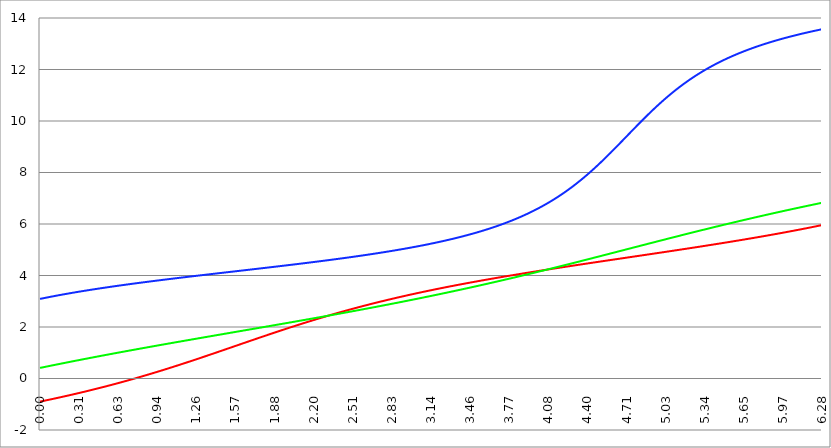
| Category | Series 1 | Series 0 | Series 2 |
|---|---|---|---|
| 0.0 | -0.898 | 0.411 | 3.091 |
| 0.00314159265358979 | -0.895 | 0.414 | 3.094 |
| 0.00628318530717958 | -0.892 | 0.417 | 3.097 |
| 0.00942477796076938 | -0.889 | 0.42 | 3.1 |
| 0.0125663706143592 | -0.885 | 0.424 | 3.103 |
| 0.015707963267949 | -0.882 | 0.427 | 3.107 |
| 0.0188495559215388 | -0.879 | 0.43 | 3.11 |
| 0.0219911485751285 | -0.876 | 0.433 | 3.113 |
| 0.0251327412287183 | -0.873 | 0.436 | 3.116 |
| 0.0282743338823081 | -0.87 | 0.439 | 3.119 |
| 0.0314159265358979 | -0.866 | 0.442 | 3.122 |
| 0.0345575191894877 | -0.863 | 0.445 | 3.125 |
| 0.0376991118430775 | -0.86 | 0.449 | 3.128 |
| 0.0408407044966673 | -0.857 | 0.452 | 3.131 |
| 0.0439822971502571 | -0.854 | 0.455 | 3.134 |
| 0.0471238898038469 | -0.85 | 0.458 | 3.137 |
| 0.0502654824574367 | -0.847 | 0.461 | 3.14 |
| 0.0534070751110265 | -0.844 | 0.464 | 3.143 |
| 0.0565486677646163 | -0.841 | 0.467 | 3.146 |
| 0.059690260418206 | -0.838 | 0.47 | 3.149 |
| 0.0628318530717958 | -0.834 | 0.473 | 3.152 |
| 0.0659734457253856 | -0.831 | 0.477 | 3.155 |
| 0.0691150383789754 | -0.828 | 0.48 | 3.158 |
| 0.0722566310325652 | -0.825 | 0.483 | 3.161 |
| 0.075398223686155 | -0.821 | 0.486 | 3.164 |
| 0.0785398163397448 | -0.818 | 0.489 | 3.167 |
| 0.0816814089933346 | -0.815 | 0.492 | 3.17 |
| 0.0848230016469244 | -0.812 | 0.495 | 3.173 |
| 0.0879645943005142 | -0.808 | 0.498 | 3.176 |
| 0.091106186954104 | -0.805 | 0.501 | 3.179 |
| 0.0942477796076937 | -0.802 | 0.504 | 3.182 |
| 0.0973893722612835 | -0.799 | 0.507 | 3.185 |
| 0.100530964914873 | -0.795 | 0.511 | 3.188 |
| 0.103672557568463 | -0.792 | 0.514 | 3.191 |
| 0.106814150222053 | -0.789 | 0.517 | 3.193 |
| 0.109955742875643 | -0.786 | 0.52 | 3.196 |
| 0.113097335529233 | -0.782 | 0.523 | 3.199 |
| 0.116238928182822 | -0.779 | 0.526 | 3.202 |
| 0.119380520836412 | -0.776 | 0.529 | 3.205 |
| 0.122522113490002 | -0.772 | 0.532 | 3.208 |
| 0.125663706143592 | -0.769 | 0.535 | 3.211 |
| 0.128805298797181 | -0.766 | 0.538 | 3.214 |
| 0.131946891450771 | -0.762 | 0.541 | 3.216 |
| 0.135088484104361 | -0.759 | 0.544 | 3.219 |
| 0.138230076757951 | -0.756 | 0.547 | 3.222 |
| 0.141371669411541 | -0.752 | 0.55 | 3.225 |
| 0.14451326206513 | -0.749 | 0.553 | 3.228 |
| 0.14765485471872 | -0.746 | 0.557 | 3.231 |
| 0.15079644737231 | -0.742 | 0.56 | 3.233 |
| 0.1539380400259 | -0.739 | 0.563 | 3.236 |
| 0.15707963267949 | -0.736 | 0.566 | 3.239 |
| 0.160221225333079 | -0.732 | 0.569 | 3.242 |
| 0.163362817986669 | -0.729 | 0.572 | 3.245 |
| 0.166504410640259 | -0.726 | 0.575 | 3.247 |
| 0.169646003293849 | -0.722 | 0.578 | 3.25 |
| 0.172787595947439 | -0.719 | 0.581 | 3.253 |
| 0.175929188601028 | -0.716 | 0.584 | 3.256 |
| 0.179070781254618 | -0.712 | 0.587 | 3.258 |
| 0.182212373908208 | -0.709 | 0.59 | 3.261 |
| 0.185353966561798 | -0.705 | 0.593 | 3.264 |
| 0.188495559215388 | -0.702 | 0.596 | 3.267 |
| 0.191637151868977 | -0.699 | 0.599 | 3.269 |
| 0.194778744522567 | -0.695 | 0.602 | 3.272 |
| 0.197920337176157 | -0.692 | 0.605 | 3.275 |
| 0.201061929829747 | -0.688 | 0.608 | 3.277 |
| 0.204203522483336 | -0.685 | 0.611 | 3.28 |
| 0.207345115136926 | -0.682 | 0.614 | 3.283 |
| 0.210486707790516 | -0.678 | 0.617 | 3.286 |
| 0.213628300444106 | -0.675 | 0.62 | 3.288 |
| 0.216769893097696 | -0.671 | 0.623 | 3.291 |
| 0.219911485751285 | -0.668 | 0.626 | 3.294 |
| 0.223053078404875 | -0.664 | 0.629 | 3.296 |
| 0.226194671058465 | -0.661 | 0.632 | 3.299 |
| 0.229336263712055 | -0.658 | 0.635 | 3.302 |
| 0.232477856365645 | -0.654 | 0.638 | 3.304 |
| 0.235619449019234 | -0.651 | 0.641 | 3.307 |
| 0.238761041672824 | -0.647 | 0.644 | 3.31 |
| 0.241902634326414 | -0.644 | 0.647 | 3.312 |
| 0.245044226980004 | -0.64 | 0.65 | 3.315 |
| 0.248185819633594 | -0.637 | 0.653 | 3.317 |
| 0.251327412287183 | -0.633 | 0.656 | 3.32 |
| 0.254469004940773 | -0.63 | 0.659 | 3.323 |
| 0.257610597594363 | -0.626 | 0.662 | 3.325 |
| 0.260752190247953 | -0.623 | 0.665 | 3.328 |
| 0.263893782901543 | -0.619 | 0.668 | 3.331 |
| 0.267035375555132 | -0.616 | 0.671 | 3.333 |
| 0.270176968208722 | -0.612 | 0.674 | 3.336 |
| 0.273318560862312 | -0.609 | 0.677 | 3.338 |
| 0.276460153515902 | -0.605 | 0.68 | 3.341 |
| 0.279601746169492 | -0.602 | 0.683 | 3.343 |
| 0.282743338823082 | -0.598 | 0.686 | 3.346 |
| 0.285884931476671 | -0.595 | 0.689 | 3.349 |
| 0.289026524130261 | -0.591 | 0.692 | 3.351 |
| 0.292168116783851 | -0.587 | 0.695 | 3.354 |
| 0.295309709437441 | -0.584 | 0.698 | 3.356 |
| 0.298451302091031 | -0.58 | 0.701 | 3.359 |
| 0.30159289474462 | -0.577 | 0.704 | 3.361 |
| 0.30473448739821 | -0.573 | 0.707 | 3.364 |
| 0.3078760800518 | -0.57 | 0.71 | 3.366 |
| 0.31101767270539 | -0.566 | 0.713 | 3.369 |
| 0.31415926535898 | -0.562 | 0.716 | 3.371 |
| 0.31730085801257 | -0.559 | 0.719 | 3.374 |
| 0.320442450666159 | -0.555 | 0.722 | 3.376 |
| 0.323584043319749 | -0.552 | 0.725 | 3.379 |
| 0.326725635973339 | -0.548 | 0.728 | 3.382 |
| 0.329867228626929 | -0.544 | 0.731 | 3.384 |
| 0.333008821280519 | -0.541 | 0.734 | 3.386 |
| 0.336150413934108 | -0.537 | 0.736 | 3.389 |
| 0.339292006587698 | -0.534 | 0.739 | 3.391 |
| 0.342433599241288 | -0.53 | 0.742 | 3.394 |
| 0.345575191894878 | -0.526 | 0.745 | 3.396 |
| 0.348716784548468 | -0.523 | 0.748 | 3.399 |
| 0.351858377202058 | -0.519 | 0.751 | 3.401 |
| 0.354999969855647 | -0.515 | 0.754 | 3.404 |
| 0.358141562509237 | -0.512 | 0.757 | 3.406 |
| 0.361283155162827 | -0.508 | 0.76 | 3.409 |
| 0.364424747816417 | -0.504 | 0.763 | 3.411 |
| 0.367566340470007 | -0.501 | 0.766 | 3.414 |
| 0.370707933123597 | -0.497 | 0.769 | 3.416 |
| 0.373849525777186 | -0.493 | 0.772 | 3.418 |
| 0.376991118430776 | -0.49 | 0.775 | 3.421 |
| 0.380132711084366 | -0.486 | 0.778 | 3.423 |
| 0.383274303737956 | -0.482 | 0.78 | 3.426 |
| 0.386415896391546 | -0.479 | 0.783 | 3.428 |
| 0.389557489045135 | -0.475 | 0.786 | 3.431 |
| 0.392699081698725 | -0.471 | 0.789 | 3.433 |
| 0.395840674352315 | -0.468 | 0.792 | 3.435 |
| 0.398982267005905 | -0.464 | 0.795 | 3.438 |
| 0.402123859659495 | -0.46 | 0.798 | 3.44 |
| 0.405265452313085 | -0.456 | 0.801 | 3.443 |
| 0.408407044966674 | -0.453 | 0.804 | 3.445 |
| 0.411548637620264 | -0.449 | 0.807 | 3.447 |
| 0.414690230273854 | -0.445 | 0.81 | 3.45 |
| 0.417831822927444 | -0.441 | 0.813 | 3.452 |
| 0.420973415581034 | -0.438 | 0.815 | 3.454 |
| 0.424115008234623 | -0.434 | 0.818 | 3.457 |
| 0.427256600888213 | -0.43 | 0.821 | 3.459 |
| 0.430398193541803 | -0.426 | 0.824 | 3.462 |
| 0.433539786195393 | -0.423 | 0.827 | 3.464 |
| 0.436681378848983 | -0.419 | 0.83 | 3.466 |
| 0.439822971502573 | -0.415 | 0.833 | 3.469 |
| 0.442964564156162 | -0.411 | 0.836 | 3.471 |
| 0.446106156809752 | -0.408 | 0.839 | 3.473 |
| 0.449247749463342 | -0.404 | 0.842 | 3.476 |
| 0.452389342116932 | -0.4 | 0.844 | 3.478 |
| 0.455530934770522 | -0.396 | 0.847 | 3.48 |
| 0.458672527424111 | -0.392 | 0.85 | 3.483 |
| 0.461814120077701 | -0.388 | 0.853 | 3.485 |
| 0.464955712731291 | -0.385 | 0.856 | 3.487 |
| 0.468097305384881 | -0.381 | 0.859 | 3.49 |
| 0.471238898038471 | -0.377 | 0.862 | 3.492 |
| 0.474380490692061 | -0.373 | 0.865 | 3.494 |
| 0.47752208334565 | -0.369 | 0.867 | 3.496 |
| 0.48066367599924 | -0.365 | 0.87 | 3.499 |
| 0.48380526865283 | -0.362 | 0.873 | 3.501 |
| 0.48694686130642 | -0.358 | 0.876 | 3.503 |
| 0.49008845396001 | -0.354 | 0.879 | 3.506 |
| 0.493230046613599 | -0.35 | 0.882 | 3.508 |
| 0.496371639267189 | -0.346 | 0.885 | 3.51 |
| 0.499513231920779 | -0.342 | 0.888 | 3.512 |
| 0.502654824574369 | -0.338 | 0.89 | 3.515 |
| 0.505796417227959 | -0.334 | 0.893 | 3.517 |
| 0.508938009881549 | -0.331 | 0.896 | 3.519 |
| 0.512079602535138 | -0.327 | 0.899 | 3.521 |
| 0.515221195188728 | -0.323 | 0.902 | 3.524 |
| 0.518362787842318 | -0.319 | 0.905 | 3.526 |
| 0.521504380495908 | -0.315 | 0.908 | 3.528 |
| 0.524645973149498 | -0.311 | 0.91 | 3.53 |
| 0.527787565803087 | -0.307 | 0.913 | 3.533 |
| 0.530929158456677 | -0.303 | 0.916 | 3.535 |
| 0.534070751110267 | -0.299 | 0.919 | 3.537 |
| 0.537212343763857 | -0.295 | 0.922 | 3.539 |
| 0.540353936417447 | -0.291 | 0.925 | 3.542 |
| 0.543495529071037 | -0.287 | 0.928 | 3.544 |
| 0.546637121724626 | -0.283 | 0.93 | 3.546 |
| 0.549778714378216 | -0.279 | 0.933 | 3.548 |
| 0.552920307031806 | -0.275 | 0.936 | 3.551 |
| 0.556061899685396 | -0.271 | 0.939 | 3.553 |
| 0.559203492338986 | -0.267 | 0.942 | 3.555 |
| 0.562345084992576 | -0.263 | 0.945 | 3.557 |
| 0.565486677646165 | -0.259 | 0.947 | 3.559 |
| 0.568628270299755 | -0.255 | 0.95 | 3.562 |
| 0.571769862953345 | -0.251 | 0.953 | 3.564 |
| 0.574911455606935 | -0.247 | 0.956 | 3.566 |
| 0.578053048260525 | -0.243 | 0.959 | 3.568 |
| 0.581194640914114 | -0.239 | 0.962 | 3.57 |
| 0.584336233567704 | -0.235 | 0.964 | 3.572 |
| 0.587477826221294 | -0.231 | 0.967 | 3.575 |
| 0.590619418874884 | -0.227 | 0.97 | 3.577 |
| 0.593761011528474 | -0.223 | 0.973 | 3.579 |
| 0.596902604182064 | -0.219 | 0.976 | 3.581 |
| 0.600044196835653 | -0.215 | 0.979 | 3.583 |
| 0.603185789489243 | -0.211 | 0.981 | 3.586 |
| 0.606327382142833 | -0.207 | 0.984 | 3.588 |
| 0.609468974796423 | -0.203 | 0.987 | 3.59 |
| 0.612610567450013 | -0.199 | 0.99 | 3.592 |
| 0.615752160103602 | -0.195 | 0.993 | 3.594 |
| 0.618893752757192 | -0.191 | 0.996 | 3.596 |
| 0.622035345410782 | -0.187 | 0.998 | 3.598 |
| 0.625176938064372 | -0.182 | 1.001 | 3.601 |
| 0.628318530717962 | -0.178 | 1.004 | 3.603 |
| 0.631460123371551 | -0.174 | 1.007 | 3.605 |
| 0.634601716025141 | -0.17 | 1.01 | 3.607 |
| 0.637743308678731 | -0.166 | 1.012 | 3.609 |
| 0.640884901332321 | -0.162 | 1.015 | 3.611 |
| 0.644026493985911 | -0.158 | 1.018 | 3.613 |
| 0.647168086639501 | -0.154 | 1.021 | 3.615 |
| 0.65030967929309 | -0.149 | 1.024 | 3.618 |
| 0.65345127194668 | -0.145 | 1.026 | 3.62 |
| 0.65659286460027 | -0.141 | 1.029 | 3.622 |
| 0.65973445725386 | -0.137 | 1.032 | 3.624 |
| 0.66287604990745 | -0.133 | 1.035 | 3.626 |
| 0.666017642561039 | -0.129 | 1.038 | 3.628 |
| 0.669159235214629 | -0.125 | 1.04 | 3.63 |
| 0.672300827868219 | -0.12 | 1.043 | 3.632 |
| 0.675442420521809 | -0.116 | 1.046 | 3.634 |
| 0.678584013175399 | -0.112 | 1.049 | 3.637 |
| 0.681725605828989 | -0.108 | 1.052 | 3.639 |
| 0.684867198482578 | -0.104 | 1.054 | 3.641 |
| 0.688008791136168 | -0.099 | 1.057 | 3.643 |
| 0.691150383789758 | -0.095 | 1.06 | 3.645 |
| 0.694291976443348 | -0.091 | 1.063 | 3.647 |
| 0.697433569096938 | -0.087 | 1.065 | 3.649 |
| 0.700575161750528 | -0.082 | 1.068 | 3.651 |
| 0.703716754404117 | -0.078 | 1.071 | 3.653 |
| 0.706858347057707 | -0.074 | 1.074 | 3.655 |
| 0.709999939711297 | -0.07 | 1.077 | 3.657 |
| 0.713141532364887 | -0.065 | 1.079 | 3.659 |
| 0.716283125018477 | -0.061 | 1.082 | 3.661 |
| 0.719424717672066 | -0.057 | 1.085 | 3.663 |
| 0.722566310325656 | -0.053 | 1.088 | 3.666 |
| 0.725707902979246 | -0.048 | 1.09 | 3.668 |
| 0.728849495632836 | -0.044 | 1.093 | 3.67 |
| 0.731991088286426 | -0.04 | 1.096 | 3.672 |
| 0.735132680940016 | -0.036 | 1.099 | 3.674 |
| 0.738274273593605 | -0.031 | 1.102 | 3.676 |
| 0.741415866247195 | -0.027 | 1.104 | 3.678 |
| 0.744557458900785 | -0.023 | 1.107 | 3.68 |
| 0.747699051554375 | -0.018 | 1.11 | 3.682 |
| 0.750840644207965 | -0.014 | 1.113 | 3.684 |
| 0.753982236861554 | -0.01 | 1.115 | 3.686 |
| 0.757123829515144 | -0.005 | 1.118 | 3.688 |
| 0.760265422168734 | -0.001 | 1.121 | 3.69 |
| 0.763407014822324 | 0.003 | 1.124 | 3.692 |
| 0.766548607475914 | 0.008 | 1.126 | 3.694 |
| 0.769690200129504 | 0.012 | 1.129 | 3.696 |
| 0.772831792783093 | 0.016 | 1.132 | 3.698 |
| 0.775973385436683 | 0.021 | 1.135 | 3.7 |
| 0.779114978090273 | 0.025 | 1.137 | 3.702 |
| 0.782256570743863 | 0.029 | 1.14 | 3.704 |
| 0.785398163397453 | 0.034 | 1.143 | 3.706 |
| 0.788539756051042 | 0.038 | 1.146 | 3.708 |
| 0.791681348704632 | 0.043 | 1.148 | 3.71 |
| 0.794822941358222 | 0.047 | 1.151 | 3.712 |
| 0.797964534011812 | 0.051 | 1.154 | 3.714 |
| 0.801106126665402 | 0.056 | 1.157 | 3.716 |
| 0.804247719318992 | 0.06 | 1.159 | 3.718 |
| 0.807389311972581 | 0.065 | 1.162 | 3.72 |
| 0.810530904626171 | 0.069 | 1.165 | 3.722 |
| 0.813672497279761 | 0.073 | 1.168 | 3.724 |
| 0.816814089933351 | 0.078 | 1.17 | 3.726 |
| 0.819955682586941 | 0.082 | 1.173 | 3.728 |
| 0.823097275240531 | 0.087 | 1.176 | 3.73 |
| 0.82623886789412 | 0.091 | 1.179 | 3.732 |
| 0.82938046054771 | 0.096 | 1.181 | 3.734 |
| 0.8325220532013 | 0.1 | 1.184 | 3.736 |
| 0.83566364585489 | 0.105 | 1.187 | 3.738 |
| 0.83880523850848 | 0.109 | 1.19 | 3.74 |
| 0.841946831162069 | 0.114 | 1.192 | 3.742 |
| 0.845088423815659 | 0.118 | 1.195 | 3.744 |
| 0.848230016469249 | 0.123 | 1.198 | 3.746 |
| 0.851371609122839 | 0.127 | 1.201 | 3.748 |
| 0.854513201776429 | 0.132 | 1.203 | 3.75 |
| 0.857654794430019 | 0.136 | 1.206 | 3.752 |
| 0.860796387083608 | 0.141 | 1.209 | 3.754 |
| 0.863937979737198 | 0.145 | 1.211 | 3.756 |
| 0.867079572390788 | 0.15 | 1.214 | 3.758 |
| 0.870221165044378 | 0.154 | 1.217 | 3.76 |
| 0.873362757697968 | 0.159 | 1.22 | 3.761 |
| 0.876504350351557 | 0.163 | 1.222 | 3.763 |
| 0.879645943005147 | 0.168 | 1.225 | 3.765 |
| 0.882787535658737 | 0.172 | 1.228 | 3.767 |
| 0.885929128312327 | 0.177 | 1.231 | 3.769 |
| 0.889070720965917 | 0.181 | 1.233 | 3.771 |
| 0.892212313619507 | 0.186 | 1.236 | 3.773 |
| 0.895353906273096 | 0.19 | 1.239 | 3.775 |
| 0.898495498926686 | 0.195 | 1.241 | 3.777 |
| 0.901637091580276 | 0.2 | 1.244 | 3.779 |
| 0.904778684233866 | 0.204 | 1.247 | 3.781 |
| 0.907920276887456 | 0.209 | 1.25 | 3.783 |
| 0.911061869541045 | 0.213 | 1.252 | 3.785 |
| 0.914203462194635 | 0.218 | 1.255 | 3.787 |
| 0.917345054848225 | 0.223 | 1.258 | 3.789 |
| 0.920486647501815 | 0.227 | 1.26 | 3.79 |
| 0.923628240155405 | 0.232 | 1.263 | 3.792 |
| 0.926769832808995 | 0.236 | 1.266 | 3.794 |
| 0.929911425462584 | 0.241 | 1.269 | 3.796 |
| 0.933053018116174 | 0.246 | 1.271 | 3.798 |
| 0.936194610769764 | 0.25 | 1.274 | 3.8 |
| 0.939336203423354 | 0.255 | 1.277 | 3.802 |
| 0.942477796076944 | 0.26 | 1.279 | 3.804 |
| 0.945619388730533 | 0.264 | 1.282 | 3.806 |
| 0.948760981384123 | 0.269 | 1.285 | 3.808 |
| 0.951902574037713 | 0.274 | 1.287 | 3.81 |
| 0.955044166691303 | 0.278 | 1.29 | 3.811 |
| 0.958185759344893 | 0.283 | 1.293 | 3.813 |
| 0.961327351998483 | 0.288 | 1.296 | 3.815 |
| 0.964468944652072 | 0.292 | 1.298 | 3.817 |
| 0.967610537305662 | 0.297 | 1.301 | 3.819 |
| 0.970752129959252 | 0.302 | 1.304 | 3.821 |
| 0.973893722612842 | 0.306 | 1.306 | 3.823 |
| 0.977035315266432 | 0.311 | 1.309 | 3.825 |
| 0.980176907920022 | 0.316 | 1.312 | 3.827 |
| 0.983318500573611 | 0.32 | 1.314 | 3.829 |
| 0.986460093227201 | 0.325 | 1.317 | 3.83 |
| 0.989601685880791 | 0.33 | 1.32 | 3.832 |
| 0.992743278534381 | 0.334 | 1.323 | 3.834 |
| 0.995884871187971 | 0.339 | 1.325 | 3.836 |
| 0.99902646384156 | 0.344 | 1.328 | 3.838 |
| 1.00216805649515 | 0.349 | 1.331 | 3.84 |
| 1.00530964914874 | 0.353 | 1.333 | 3.842 |
| 1.00845124180233 | 0.358 | 1.336 | 3.844 |
| 1.01159283445592 | 0.363 | 1.339 | 3.845 |
| 1.01473442710951 | 0.368 | 1.341 | 3.847 |
| 1.017876019763099 | 0.372 | 1.344 | 3.849 |
| 1.021017612416689 | 0.377 | 1.347 | 3.851 |
| 1.02415920507028 | 0.382 | 1.349 | 3.853 |
| 1.027300797723869 | 0.387 | 1.352 | 3.855 |
| 1.030442390377459 | 0.392 | 1.355 | 3.857 |
| 1.033583983031048 | 0.396 | 1.357 | 3.858 |
| 1.036725575684638 | 0.401 | 1.36 | 3.86 |
| 1.039867168338228 | 0.406 | 1.363 | 3.862 |
| 1.043008760991818 | 0.411 | 1.365 | 3.864 |
| 1.046150353645408 | 0.416 | 1.368 | 3.866 |
| 1.049291946298998 | 0.42 | 1.371 | 3.868 |
| 1.052433538952587 | 0.425 | 1.374 | 3.87 |
| 1.055575131606177 | 0.43 | 1.376 | 3.871 |
| 1.058716724259767 | 0.435 | 1.379 | 3.873 |
| 1.061858316913357 | 0.44 | 1.382 | 3.875 |
| 1.064999909566947 | 0.444 | 1.384 | 3.877 |
| 1.068141502220536 | 0.449 | 1.387 | 3.879 |
| 1.071283094874126 | 0.454 | 1.39 | 3.881 |
| 1.074424687527716 | 0.459 | 1.392 | 3.883 |
| 1.077566280181306 | 0.464 | 1.395 | 3.884 |
| 1.080707872834896 | 0.469 | 1.398 | 3.886 |
| 1.083849465488486 | 0.473 | 1.4 | 3.888 |
| 1.086991058142075 | 0.478 | 1.403 | 3.89 |
| 1.090132650795665 | 0.483 | 1.406 | 3.892 |
| 1.093274243449255 | 0.488 | 1.408 | 3.894 |
| 1.096415836102845 | 0.493 | 1.411 | 3.895 |
| 1.099557428756435 | 0.498 | 1.414 | 3.897 |
| 1.102699021410025 | 0.503 | 1.416 | 3.899 |
| 1.105840614063614 | 0.508 | 1.419 | 3.901 |
| 1.108982206717204 | 0.513 | 1.422 | 3.903 |
| 1.112123799370794 | 0.517 | 1.424 | 3.905 |
| 1.115265392024384 | 0.522 | 1.427 | 3.906 |
| 1.118406984677974 | 0.527 | 1.43 | 3.908 |
| 1.121548577331563 | 0.532 | 1.432 | 3.91 |
| 1.124690169985153 | 0.537 | 1.435 | 3.912 |
| 1.127831762638743 | 0.542 | 1.438 | 3.914 |
| 1.130973355292333 | 0.547 | 1.44 | 3.916 |
| 1.134114947945923 | 0.552 | 1.443 | 3.917 |
| 1.137256540599513 | 0.557 | 1.446 | 3.919 |
| 1.140398133253102 | 0.562 | 1.448 | 3.921 |
| 1.143539725906692 | 0.567 | 1.451 | 3.923 |
| 1.146681318560282 | 0.572 | 1.454 | 3.925 |
| 1.149822911213872 | 0.576 | 1.456 | 3.926 |
| 1.152964503867462 | 0.581 | 1.459 | 3.928 |
| 1.156106096521051 | 0.586 | 1.461 | 3.93 |
| 1.159247689174641 | 0.591 | 1.464 | 3.932 |
| 1.162389281828231 | 0.596 | 1.467 | 3.934 |
| 1.165530874481821 | 0.601 | 1.469 | 3.936 |
| 1.168672467135411 | 0.606 | 1.472 | 3.937 |
| 1.171814059789001 | 0.611 | 1.475 | 3.939 |
| 1.17495565244259 | 0.616 | 1.477 | 3.941 |
| 1.17809724509618 | 0.621 | 1.48 | 3.943 |
| 1.18123883774977 | 0.626 | 1.483 | 3.945 |
| 1.18438043040336 | 0.631 | 1.485 | 3.946 |
| 1.18752202305695 | 0.636 | 1.488 | 3.948 |
| 1.190663615710539 | 0.641 | 1.491 | 3.95 |
| 1.193805208364129 | 0.646 | 1.493 | 3.952 |
| 1.19694680101772 | 0.651 | 1.496 | 3.954 |
| 1.200088393671309 | 0.656 | 1.499 | 3.955 |
| 1.203229986324899 | 0.661 | 1.501 | 3.957 |
| 1.206371578978489 | 0.666 | 1.504 | 3.959 |
| 1.209513171632078 | 0.671 | 1.507 | 3.961 |
| 1.212654764285668 | 0.676 | 1.509 | 3.963 |
| 1.215796356939258 | 0.681 | 1.512 | 3.964 |
| 1.218937949592848 | 0.686 | 1.514 | 3.966 |
| 1.222079542246438 | 0.691 | 1.517 | 3.968 |
| 1.225221134900027 | 0.696 | 1.52 | 3.97 |
| 1.228362727553617 | 0.701 | 1.522 | 3.972 |
| 1.231504320207207 | 0.706 | 1.525 | 3.973 |
| 1.234645912860797 | 0.711 | 1.528 | 3.975 |
| 1.237787505514387 | 0.717 | 1.53 | 3.977 |
| 1.240929098167977 | 0.722 | 1.533 | 3.979 |
| 1.244070690821566 | 0.727 | 1.536 | 3.981 |
| 1.247212283475156 | 0.732 | 1.538 | 3.982 |
| 1.250353876128746 | 0.737 | 1.541 | 3.984 |
| 1.253495468782336 | 0.742 | 1.544 | 3.986 |
| 1.256637061435926 | 0.747 | 1.546 | 3.988 |
| 1.259778654089515 | 0.752 | 1.549 | 3.989 |
| 1.262920246743105 | 0.757 | 1.551 | 3.991 |
| 1.266061839396695 | 0.762 | 1.554 | 3.993 |
| 1.269203432050285 | 0.767 | 1.557 | 3.995 |
| 1.272345024703875 | 0.772 | 1.559 | 3.997 |
| 1.275486617357465 | 0.777 | 1.562 | 3.998 |
| 1.278628210011054 | 0.782 | 1.565 | 4 |
| 1.281769802664644 | 0.788 | 1.567 | 4.002 |
| 1.284911395318234 | 0.793 | 1.57 | 4.004 |
| 1.288052987971824 | 0.798 | 1.573 | 4.005 |
| 1.291194580625414 | 0.803 | 1.575 | 4.007 |
| 1.294336173279003 | 0.808 | 1.578 | 4.009 |
| 1.297477765932593 | 0.813 | 1.58 | 4.011 |
| 1.300619358586183 | 0.818 | 1.583 | 4.013 |
| 1.303760951239773 | 0.823 | 1.586 | 4.014 |
| 1.306902543893363 | 0.828 | 1.588 | 4.016 |
| 1.310044136546953 | 0.834 | 1.591 | 4.018 |
| 1.313185729200542 | 0.839 | 1.594 | 4.02 |
| 1.316327321854132 | 0.844 | 1.596 | 4.021 |
| 1.319468914507722 | 0.849 | 1.599 | 4.023 |
| 1.322610507161312 | 0.854 | 1.602 | 4.025 |
| 1.325752099814902 | 0.859 | 1.604 | 4.027 |
| 1.328893692468491 | 0.864 | 1.607 | 4.029 |
| 1.332035285122081 | 0.869 | 1.609 | 4.03 |
| 1.335176877775671 | 0.875 | 1.612 | 4.032 |
| 1.338318470429261 | 0.88 | 1.615 | 4.034 |
| 1.341460063082851 | 0.885 | 1.617 | 4.036 |
| 1.344601655736441 | 0.89 | 1.62 | 4.037 |
| 1.34774324839003 | 0.895 | 1.623 | 4.039 |
| 1.35088484104362 | 0.9 | 1.625 | 4.041 |
| 1.35402643369721 | 0.905 | 1.628 | 4.043 |
| 1.3571680263508 | 0.911 | 1.63 | 4.044 |
| 1.36030961900439 | 0.916 | 1.633 | 4.046 |
| 1.363451211657979 | 0.921 | 1.636 | 4.048 |
| 1.36659280431157 | 0.926 | 1.638 | 4.05 |
| 1.369734396965159 | 0.931 | 1.641 | 4.051 |
| 1.372875989618749 | 0.936 | 1.644 | 4.053 |
| 1.376017582272339 | 0.942 | 1.646 | 4.055 |
| 1.379159174925929 | 0.947 | 1.649 | 4.057 |
| 1.382300767579518 | 0.952 | 1.651 | 4.058 |
| 1.385442360233108 | 0.957 | 1.654 | 4.06 |
| 1.388583952886698 | 0.962 | 1.657 | 4.062 |
| 1.391725545540288 | 0.967 | 1.659 | 4.064 |
| 1.394867138193878 | 0.973 | 1.662 | 4.066 |
| 1.398008730847468 | 0.978 | 1.665 | 4.067 |
| 1.401150323501057 | 0.983 | 1.667 | 4.069 |
| 1.404291916154647 | 0.988 | 1.67 | 4.071 |
| 1.407433508808237 | 0.993 | 1.672 | 4.073 |
| 1.410575101461827 | 0.999 | 1.675 | 4.074 |
| 1.413716694115417 | 1.004 | 1.678 | 4.076 |
| 1.416858286769006 | 1.009 | 1.68 | 4.078 |
| 1.419999879422596 | 1.014 | 1.683 | 4.08 |
| 1.423141472076186 | 1.019 | 1.686 | 4.081 |
| 1.426283064729776 | 1.025 | 1.688 | 4.083 |
| 1.429424657383366 | 1.03 | 1.691 | 4.085 |
| 1.432566250036956 | 1.035 | 1.693 | 4.087 |
| 1.435707842690545 | 1.04 | 1.696 | 4.088 |
| 1.438849435344135 | 1.045 | 1.699 | 4.09 |
| 1.441991027997725 | 1.051 | 1.701 | 4.092 |
| 1.445132620651315 | 1.056 | 1.704 | 4.094 |
| 1.448274213304905 | 1.061 | 1.707 | 4.095 |
| 1.451415805958494 | 1.066 | 1.709 | 4.097 |
| 1.454557398612084 | 1.071 | 1.712 | 4.099 |
| 1.457698991265674 | 1.077 | 1.714 | 4.101 |
| 1.460840583919264 | 1.082 | 1.717 | 4.102 |
| 1.463982176572854 | 1.087 | 1.72 | 4.104 |
| 1.467123769226444 | 1.092 | 1.722 | 4.106 |
| 1.470265361880033 | 1.098 | 1.725 | 4.108 |
| 1.473406954533623 | 1.103 | 1.728 | 4.109 |
| 1.476548547187213 | 1.108 | 1.73 | 4.111 |
| 1.479690139840803 | 1.113 | 1.733 | 4.113 |
| 1.482831732494393 | 1.118 | 1.735 | 4.115 |
| 1.485973325147982 | 1.124 | 1.738 | 4.116 |
| 1.489114917801572 | 1.129 | 1.741 | 4.118 |
| 1.492256510455162 | 1.134 | 1.743 | 4.12 |
| 1.495398103108752 | 1.139 | 1.746 | 4.122 |
| 1.498539695762342 | 1.145 | 1.748 | 4.123 |
| 1.501681288415932 | 1.15 | 1.751 | 4.125 |
| 1.504822881069521 | 1.155 | 1.754 | 4.127 |
| 1.507964473723111 | 1.16 | 1.756 | 4.129 |
| 1.511106066376701 | 1.165 | 1.759 | 4.13 |
| 1.514247659030291 | 1.171 | 1.762 | 4.132 |
| 1.517389251683881 | 1.176 | 1.764 | 4.134 |
| 1.520530844337471 | 1.181 | 1.767 | 4.136 |
| 1.52367243699106 | 1.186 | 1.769 | 4.137 |
| 1.52681402964465 | 1.192 | 1.772 | 4.139 |
| 1.52995562229824 | 1.197 | 1.775 | 4.141 |
| 1.53309721495183 | 1.202 | 1.777 | 4.143 |
| 1.53623880760542 | 1.207 | 1.78 | 4.144 |
| 1.539380400259009 | 1.213 | 1.783 | 4.146 |
| 1.542521992912599 | 1.218 | 1.785 | 4.148 |
| 1.545663585566189 | 1.223 | 1.788 | 4.15 |
| 1.548805178219779 | 1.228 | 1.79 | 4.151 |
| 1.551946770873369 | 1.233 | 1.793 | 4.153 |
| 1.555088363526959 | 1.239 | 1.796 | 4.155 |
| 1.558229956180548 | 1.244 | 1.798 | 4.157 |
| 1.561371548834138 | 1.249 | 1.801 | 4.158 |
| 1.564513141487728 | 1.254 | 1.803 | 4.16 |
| 1.567654734141318 | 1.26 | 1.806 | 4.162 |
| 1.570796326794908 | 1.265 | 1.809 | 4.163 |
| 1.573937919448497 | 1.27 | 1.811 | 4.165 |
| 1.577079512102087 | 1.275 | 1.814 | 4.167 |
| 1.580221104755677 | 1.281 | 1.817 | 4.169 |
| 1.583362697409267 | 1.286 | 1.819 | 4.17 |
| 1.586504290062857 | 1.291 | 1.822 | 4.172 |
| 1.589645882716447 | 1.296 | 1.824 | 4.174 |
| 1.592787475370036 | 1.302 | 1.827 | 4.176 |
| 1.595929068023626 | 1.307 | 1.83 | 4.177 |
| 1.599070660677216 | 1.312 | 1.832 | 4.179 |
| 1.602212253330806 | 1.317 | 1.835 | 4.181 |
| 1.605353845984396 | 1.322 | 1.837 | 4.183 |
| 1.608495438637985 | 1.328 | 1.84 | 4.184 |
| 1.611637031291575 | 1.333 | 1.843 | 4.186 |
| 1.614778623945165 | 1.338 | 1.845 | 4.188 |
| 1.617920216598755 | 1.343 | 1.848 | 4.19 |
| 1.621061809252345 | 1.349 | 1.851 | 4.191 |
| 1.624203401905935 | 1.354 | 1.853 | 4.193 |
| 1.627344994559524 | 1.359 | 1.856 | 4.195 |
| 1.630486587213114 | 1.364 | 1.858 | 4.197 |
| 1.633628179866704 | 1.37 | 1.861 | 4.198 |
| 1.636769772520294 | 1.375 | 1.864 | 4.2 |
| 1.639911365173884 | 1.38 | 1.866 | 4.202 |
| 1.643052957827473 | 1.385 | 1.869 | 4.204 |
| 1.646194550481063 | 1.39 | 1.872 | 4.205 |
| 1.649336143134653 | 1.396 | 1.874 | 4.207 |
| 1.652477735788243 | 1.401 | 1.877 | 4.209 |
| 1.655619328441833 | 1.406 | 1.879 | 4.211 |
| 1.658760921095423 | 1.411 | 1.882 | 4.212 |
| 1.661902513749012 | 1.417 | 1.885 | 4.214 |
| 1.665044106402602 | 1.422 | 1.887 | 4.216 |
| 1.668185699056192 | 1.427 | 1.89 | 4.218 |
| 1.671327291709782 | 1.432 | 1.892 | 4.219 |
| 1.674468884363372 | 1.437 | 1.895 | 4.221 |
| 1.677610477016961 | 1.443 | 1.898 | 4.223 |
| 1.680752069670551 | 1.448 | 1.9 | 4.225 |
| 1.683893662324141 | 1.453 | 1.903 | 4.226 |
| 1.687035254977731 | 1.458 | 1.906 | 4.228 |
| 1.690176847631321 | 1.464 | 1.908 | 4.23 |
| 1.693318440284911 | 1.469 | 1.911 | 4.232 |
| 1.6964600329385 | 1.474 | 1.913 | 4.233 |
| 1.69960162559209 | 1.479 | 1.916 | 4.235 |
| 1.70274321824568 | 1.484 | 1.919 | 4.237 |
| 1.70588481089927 | 1.49 | 1.921 | 4.239 |
| 1.70902640355286 | 1.495 | 1.924 | 4.24 |
| 1.712167996206449 | 1.5 | 1.927 | 4.242 |
| 1.715309588860039 | 1.505 | 1.929 | 4.244 |
| 1.71845118151363 | 1.51 | 1.932 | 4.246 |
| 1.721592774167219 | 1.516 | 1.934 | 4.247 |
| 1.724734366820809 | 1.521 | 1.937 | 4.249 |
| 1.727875959474399 | 1.526 | 1.94 | 4.251 |
| 1.731017552127988 | 1.531 | 1.942 | 4.253 |
| 1.734159144781578 | 1.536 | 1.945 | 4.254 |
| 1.737300737435168 | 1.542 | 1.948 | 4.256 |
| 1.740442330088758 | 1.547 | 1.95 | 4.258 |
| 1.743583922742348 | 1.552 | 1.953 | 4.26 |
| 1.746725515395937 | 1.557 | 1.955 | 4.261 |
| 1.749867108049527 | 1.562 | 1.958 | 4.263 |
| 1.753008700703117 | 1.567 | 1.961 | 4.265 |
| 1.756150293356707 | 1.573 | 1.963 | 4.267 |
| 1.759291886010297 | 1.578 | 1.966 | 4.268 |
| 1.762433478663887 | 1.583 | 1.969 | 4.27 |
| 1.765575071317476 | 1.588 | 1.971 | 4.272 |
| 1.768716663971066 | 1.593 | 1.974 | 4.274 |
| 1.771858256624656 | 1.598 | 1.976 | 4.276 |
| 1.774999849278246 | 1.604 | 1.979 | 4.277 |
| 1.778141441931836 | 1.609 | 1.982 | 4.279 |
| 1.781283034585426 | 1.614 | 1.984 | 4.281 |
| 1.784424627239015 | 1.619 | 1.987 | 4.283 |
| 1.787566219892605 | 1.624 | 1.99 | 4.284 |
| 1.790707812546195 | 1.629 | 1.992 | 4.286 |
| 1.793849405199785 | 1.635 | 1.995 | 4.288 |
| 1.796990997853375 | 1.64 | 1.997 | 4.29 |
| 1.800132590506964 | 1.645 | 2 | 4.291 |
| 1.803274183160554 | 1.65 | 2.003 | 4.293 |
| 1.806415775814144 | 1.655 | 2.005 | 4.295 |
| 1.809557368467734 | 1.66 | 2.008 | 4.297 |
| 1.812698961121324 | 1.665 | 2.011 | 4.298 |
| 1.815840553774914 | 1.671 | 2.013 | 4.3 |
| 1.818982146428503 | 1.676 | 2.016 | 4.302 |
| 1.822123739082093 | 1.681 | 2.019 | 4.304 |
| 1.825265331735683 | 1.686 | 2.021 | 4.306 |
| 1.828406924389273 | 1.691 | 2.024 | 4.307 |
| 1.831548517042863 | 1.696 | 2.026 | 4.309 |
| 1.834690109696452 | 1.701 | 2.029 | 4.311 |
| 1.837831702350042 | 1.706 | 2.032 | 4.313 |
| 1.840973295003632 | 1.712 | 2.034 | 4.314 |
| 1.844114887657222 | 1.717 | 2.037 | 4.316 |
| 1.847256480310812 | 1.722 | 2.04 | 4.318 |
| 1.850398072964402 | 1.727 | 2.042 | 4.32 |
| 1.853539665617991 | 1.732 | 2.045 | 4.322 |
| 1.856681258271581 | 1.737 | 2.047 | 4.323 |
| 1.859822850925171 | 1.742 | 2.05 | 4.325 |
| 1.862964443578761 | 1.747 | 2.053 | 4.327 |
| 1.866106036232351 | 1.752 | 2.055 | 4.329 |
| 1.86924762888594 | 1.757 | 2.058 | 4.33 |
| 1.87238922153953 | 1.763 | 2.061 | 4.332 |
| 1.87553081419312 | 1.768 | 2.063 | 4.334 |
| 1.87867240684671 | 1.773 | 2.066 | 4.336 |
| 1.8818139995003 | 1.778 | 2.069 | 4.338 |
| 1.88495559215389 | 1.783 | 2.071 | 4.339 |
| 1.888097184807479 | 1.788 | 2.074 | 4.341 |
| 1.891238777461069 | 1.793 | 2.076 | 4.343 |
| 1.89438037011466 | 1.798 | 2.079 | 4.345 |
| 1.897521962768249 | 1.803 | 2.082 | 4.346 |
| 1.900663555421839 | 1.808 | 2.084 | 4.348 |
| 1.903805148075429 | 1.813 | 2.087 | 4.35 |
| 1.906946740729018 | 1.818 | 2.09 | 4.352 |
| 1.910088333382608 | 1.823 | 2.092 | 4.354 |
| 1.913229926036198 | 1.828 | 2.095 | 4.355 |
| 1.916371518689788 | 1.833 | 2.098 | 4.357 |
| 1.919513111343378 | 1.838 | 2.1 | 4.359 |
| 1.922654703996967 | 1.843 | 2.103 | 4.361 |
| 1.925796296650557 | 1.849 | 2.106 | 4.363 |
| 1.928937889304147 | 1.854 | 2.108 | 4.364 |
| 1.932079481957737 | 1.859 | 2.111 | 4.366 |
| 1.935221074611327 | 1.864 | 2.114 | 4.368 |
| 1.938362667264917 | 1.869 | 2.116 | 4.37 |
| 1.941504259918506 | 1.874 | 2.119 | 4.372 |
| 1.944645852572096 | 1.879 | 2.121 | 4.373 |
| 1.947787445225686 | 1.884 | 2.124 | 4.375 |
| 1.950929037879276 | 1.889 | 2.127 | 4.377 |
| 1.954070630532866 | 1.894 | 2.129 | 4.379 |
| 1.957212223186455 | 1.899 | 2.132 | 4.381 |
| 1.960353815840045 | 1.904 | 2.135 | 4.382 |
| 1.963495408493635 | 1.909 | 2.137 | 4.384 |
| 1.966637001147225 | 1.914 | 2.14 | 4.386 |
| 1.969778593800815 | 1.919 | 2.143 | 4.388 |
| 1.972920186454405 | 1.924 | 2.145 | 4.39 |
| 1.976061779107994 | 1.928 | 2.148 | 4.391 |
| 1.979203371761584 | 1.933 | 2.151 | 4.393 |
| 1.982344964415174 | 1.938 | 2.153 | 4.395 |
| 1.985486557068764 | 1.943 | 2.156 | 4.397 |
| 1.988628149722354 | 1.948 | 2.159 | 4.399 |
| 1.991769742375943 | 1.953 | 2.161 | 4.4 |
| 1.994911335029533 | 1.958 | 2.164 | 4.402 |
| 1.998052927683123 | 1.963 | 2.167 | 4.404 |
| 2.001194520336712 | 1.968 | 2.169 | 4.406 |
| 2.004336112990302 | 1.973 | 2.172 | 4.408 |
| 2.007477705643892 | 1.978 | 2.175 | 4.41 |
| 2.010619298297482 | 1.983 | 2.177 | 4.411 |
| 2.013760890951071 | 1.988 | 2.18 | 4.413 |
| 2.016902483604661 | 1.993 | 2.183 | 4.415 |
| 2.02004407625825 | 1.998 | 2.185 | 4.417 |
| 2.02318566891184 | 2.003 | 2.188 | 4.419 |
| 2.02632726156543 | 2.007 | 2.19 | 4.421 |
| 2.029468854219019 | 2.012 | 2.193 | 4.422 |
| 2.032610446872609 | 2.017 | 2.196 | 4.424 |
| 2.035752039526198 | 2.022 | 2.198 | 4.426 |
| 2.038893632179788 | 2.027 | 2.201 | 4.428 |
| 2.042035224833378 | 2.032 | 2.204 | 4.43 |
| 2.045176817486967 | 2.037 | 2.206 | 4.432 |
| 2.048318410140557 | 2.042 | 2.209 | 4.433 |
| 2.051460002794146 | 2.047 | 2.212 | 4.435 |
| 2.054601595447736 | 2.051 | 2.214 | 4.437 |
| 2.057743188101325 | 2.056 | 2.217 | 4.439 |
| 2.060884780754915 | 2.061 | 2.22 | 4.441 |
| 2.064026373408505 | 2.066 | 2.222 | 4.443 |
| 2.067167966062094 | 2.071 | 2.225 | 4.444 |
| 2.070309558715684 | 2.076 | 2.228 | 4.446 |
| 2.073451151369273 | 2.081 | 2.231 | 4.448 |
| 2.076592744022863 | 2.085 | 2.233 | 4.45 |
| 2.079734336676452 | 2.09 | 2.236 | 4.452 |
| 2.082875929330042 | 2.095 | 2.239 | 4.454 |
| 2.086017521983632 | 2.1 | 2.241 | 4.455 |
| 2.089159114637221 | 2.105 | 2.244 | 4.457 |
| 2.092300707290811 | 2.109 | 2.247 | 4.459 |
| 2.095442299944401 | 2.114 | 2.249 | 4.461 |
| 2.09858389259799 | 2.119 | 2.252 | 4.463 |
| 2.10172548525158 | 2.124 | 2.255 | 4.465 |
| 2.104867077905169 | 2.129 | 2.257 | 4.467 |
| 2.108008670558759 | 2.133 | 2.26 | 4.468 |
| 2.111150263212349 | 2.138 | 2.263 | 4.47 |
| 2.114291855865938 | 2.143 | 2.265 | 4.472 |
| 2.117433448519528 | 2.148 | 2.268 | 4.474 |
| 2.120575041173117 | 2.153 | 2.271 | 4.476 |
| 2.123716633826707 | 2.157 | 2.273 | 4.478 |
| 2.126858226480297 | 2.162 | 2.276 | 4.48 |
| 2.129999819133886 | 2.167 | 2.279 | 4.482 |
| 2.133141411787476 | 2.172 | 2.281 | 4.483 |
| 2.136283004441065 | 2.176 | 2.284 | 4.485 |
| 2.139424597094655 | 2.181 | 2.287 | 4.487 |
| 2.142566189748245 | 2.186 | 2.289 | 4.489 |
| 2.145707782401834 | 2.191 | 2.292 | 4.491 |
| 2.148849375055424 | 2.195 | 2.295 | 4.493 |
| 2.151990967709013 | 2.2 | 2.298 | 4.495 |
| 2.155132560362603 | 2.205 | 2.3 | 4.497 |
| 2.158274153016193 | 2.209 | 2.303 | 4.498 |
| 2.161415745669782 | 2.214 | 2.306 | 4.5 |
| 2.164557338323372 | 2.219 | 2.308 | 4.502 |
| 2.167698930976961 | 2.224 | 2.311 | 4.504 |
| 2.170840523630551 | 2.228 | 2.314 | 4.506 |
| 2.173982116284141 | 2.233 | 2.316 | 4.508 |
| 2.17712370893773 | 2.238 | 2.319 | 4.51 |
| 2.18026530159132 | 2.242 | 2.322 | 4.512 |
| 2.183406894244909 | 2.247 | 2.325 | 4.514 |
| 2.186548486898499 | 2.252 | 2.327 | 4.515 |
| 2.189690079552089 | 2.256 | 2.33 | 4.517 |
| 2.192831672205678 | 2.261 | 2.333 | 4.519 |
| 2.195973264859268 | 2.266 | 2.335 | 4.521 |
| 2.199114857512857 | 2.27 | 2.338 | 4.523 |
| 2.202256450166447 | 2.275 | 2.341 | 4.525 |
| 2.205398042820036 | 2.279 | 2.343 | 4.527 |
| 2.208539635473626 | 2.284 | 2.346 | 4.529 |
| 2.211681228127216 | 2.289 | 2.349 | 4.531 |
| 2.214822820780805 | 2.293 | 2.352 | 4.533 |
| 2.217964413434395 | 2.298 | 2.354 | 4.535 |
| 2.221106006087984 | 2.303 | 2.357 | 4.536 |
| 2.224247598741574 | 2.307 | 2.36 | 4.538 |
| 2.227389191395164 | 2.312 | 2.362 | 4.54 |
| 2.230530784048753 | 2.316 | 2.365 | 4.542 |
| 2.233672376702343 | 2.321 | 2.368 | 4.544 |
| 2.236813969355933 | 2.326 | 2.371 | 4.546 |
| 2.239955562009522 | 2.33 | 2.373 | 4.548 |
| 2.243097154663112 | 2.335 | 2.376 | 4.55 |
| 2.246238747316701 | 2.339 | 2.379 | 4.552 |
| 2.249380339970291 | 2.344 | 2.381 | 4.554 |
| 2.252521932623881 | 2.348 | 2.384 | 4.556 |
| 2.25566352527747 | 2.353 | 2.387 | 4.558 |
| 2.25880511793106 | 2.358 | 2.39 | 4.56 |
| 2.261946710584649 | 2.362 | 2.392 | 4.562 |
| 2.265088303238239 | 2.367 | 2.395 | 4.564 |
| 2.268229895891829 | 2.371 | 2.398 | 4.565 |
| 2.271371488545418 | 2.376 | 2.4 | 4.567 |
| 2.274513081199008 | 2.38 | 2.403 | 4.569 |
| 2.277654673852597 | 2.385 | 2.406 | 4.571 |
| 2.280796266506186 | 2.389 | 2.409 | 4.573 |
| 2.283937859159776 | 2.394 | 2.411 | 4.575 |
| 2.287079451813366 | 2.398 | 2.414 | 4.577 |
| 2.290221044466955 | 2.403 | 2.417 | 4.579 |
| 2.293362637120545 | 2.407 | 2.42 | 4.581 |
| 2.296504229774135 | 2.412 | 2.422 | 4.583 |
| 2.299645822427724 | 2.416 | 2.425 | 4.585 |
| 2.302787415081314 | 2.421 | 2.428 | 4.587 |
| 2.305929007734904 | 2.425 | 2.43 | 4.589 |
| 2.309070600388493 | 2.43 | 2.433 | 4.591 |
| 2.312212193042083 | 2.434 | 2.436 | 4.593 |
| 2.315353785695672 | 2.439 | 2.439 | 4.595 |
| 2.318495378349262 | 2.443 | 2.441 | 4.597 |
| 2.321636971002852 | 2.447 | 2.444 | 4.599 |
| 2.324778563656441 | 2.452 | 2.447 | 4.601 |
| 2.327920156310031 | 2.456 | 2.45 | 4.603 |
| 2.33106174896362 | 2.461 | 2.452 | 4.605 |
| 2.33420334161721 | 2.465 | 2.455 | 4.607 |
| 2.3373449342708 | 2.47 | 2.458 | 4.609 |
| 2.340486526924389 | 2.474 | 2.461 | 4.611 |
| 2.343628119577979 | 2.478 | 2.463 | 4.613 |
| 2.346769712231568 | 2.483 | 2.466 | 4.615 |
| 2.349911304885158 | 2.487 | 2.469 | 4.617 |
| 2.353052897538748 | 2.492 | 2.472 | 4.619 |
| 2.356194490192337 | 2.496 | 2.474 | 4.621 |
| 2.359336082845927 | 2.5 | 2.477 | 4.623 |
| 2.362477675499516 | 2.505 | 2.48 | 4.625 |
| 2.365619268153106 | 2.509 | 2.483 | 4.627 |
| 2.368760860806696 | 2.513 | 2.485 | 4.629 |
| 2.371902453460285 | 2.518 | 2.488 | 4.631 |
| 2.375044046113875 | 2.522 | 2.491 | 4.633 |
| 2.378185638767464 | 2.526 | 2.494 | 4.635 |
| 2.381327231421054 | 2.531 | 2.496 | 4.637 |
| 2.384468824074644 | 2.535 | 2.499 | 4.639 |
| 2.387610416728233 | 2.539 | 2.502 | 4.641 |
| 2.390752009381823 | 2.544 | 2.505 | 4.643 |
| 2.393893602035412 | 2.548 | 2.508 | 4.645 |
| 2.397035194689002 | 2.552 | 2.51 | 4.647 |
| 2.400176787342591 | 2.557 | 2.513 | 4.649 |
| 2.403318379996181 | 2.561 | 2.516 | 4.651 |
| 2.406459972649771 | 2.565 | 2.519 | 4.653 |
| 2.40960156530336 | 2.57 | 2.521 | 4.655 |
| 2.41274315795695 | 2.574 | 2.524 | 4.657 |
| 2.41588475061054 | 2.578 | 2.527 | 4.659 |
| 2.419026343264129 | 2.582 | 2.53 | 4.661 |
| 2.422167935917719 | 2.587 | 2.532 | 4.663 |
| 2.425309528571308 | 2.591 | 2.535 | 4.666 |
| 2.428451121224898 | 2.595 | 2.538 | 4.668 |
| 2.431592713878488 | 2.599 | 2.541 | 4.67 |
| 2.434734306532077 | 2.604 | 2.544 | 4.672 |
| 2.437875899185667 | 2.608 | 2.546 | 4.674 |
| 2.441017491839256 | 2.612 | 2.549 | 4.676 |
| 2.444159084492846 | 2.616 | 2.552 | 4.678 |
| 2.447300677146435 | 2.621 | 2.555 | 4.68 |
| 2.450442269800025 | 2.625 | 2.557 | 4.682 |
| 2.453583862453615 | 2.629 | 2.56 | 4.684 |
| 2.456725455107204 | 2.633 | 2.563 | 4.686 |
| 2.459867047760794 | 2.638 | 2.566 | 4.688 |
| 2.463008640414384 | 2.642 | 2.569 | 4.69 |
| 2.466150233067973 | 2.646 | 2.571 | 4.693 |
| 2.469291825721563 | 2.65 | 2.574 | 4.695 |
| 2.472433418375152 | 2.654 | 2.577 | 4.697 |
| 2.475575011028742 | 2.658 | 2.58 | 4.699 |
| 2.478716603682332 | 2.663 | 2.583 | 4.701 |
| 2.481858196335921 | 2.667 | 2.585 | 4.703 |
| 2.48499978898951 | 2.671 | 2.588 | 4.705 |
| 2.4881413816431 | 2.675 | 2.591 | 4.707 |
| 2.49128297429669 | 2.679 | 2.594 | 4.709 |
| 2.49442456695028 | 2.683 | 2.597 | 4.712 |
| 2.497566159603869 | 2.688 | 2.599 | 4.714 |
| 2.500707752257458 | 2.692 | 2.602 | 4.716 |
| 2.503849344911048 | 2.696 | 2.605 | 4.718 |
| 2.506990937564638 | 2.7 | 2.608 | 4.72 |
| 2.510132530218228 | 2.704 | 2.611 | 4.722 |
| 2.513274122871817 | 2.708 | 2.613 | 4.724 |
| 2.516415715525407 | 2.712 | 2.616 | 4.726 |
| 2.519557308178996 | 2.716 | 2.619 | 4.729 |
| 2.522698900832586 | 2.72 | 2.622 | 4.731 |
| 2.525840493486176 | 2.725 | 2.625 | 4.733 |
| 2.528982086139765 | 2.729 | 2.628 | 4.735 |
| 2.532123678793355 | 2.733 | 2.63 | 4.737 |
| 2.535265271446944 | 2.737 | 2.633 | 4.739 |
| 2.538406864100534 | 2.741 | 2.636 | 4.741 |
| 2.541548456754124 | 2.745 | 2.639 | 4.744 |
| 2.544690049407713 | 2.749 | 2.642 | 4.746 |
| 2.547831642061302 | 2.753 | 2.644 | 4.748 |
| 2.550973234714892 | 2.757 | 2.647 | 4.75 |
| 2.554114827368482 | 2.761 | 2.65 | 4.752 |
| 2.557256420022072 | 2.765 | 2.653 | 4.754 |
| 2.560398012675661 | 2.769 | 2.656 | 4.757 |
| 2.563539605329251 | 2.773 | 2.659 | 4.759 |
| 2.56668119798284 | 2.777 | 2.661 | 4.761 |
| 2.56982279063643 | 2.781 | 2.664 | 4.763 |
| 2.57296438329002 | 2.785 | 2.667 | 4.765 |
| 2.576105975943609 | 2.789 | 2.67 | 4.768 |
| 2.579247568597199 | 2.793 | 2.673 | 4.77 |
| 2.582389161250788 | 2.797 | 2.676 | 4.772 |
| 2.585530753904377 | 2.801 | 2.678 | 4.774 |
| 2.588672346557967 | 2.805 | 2.681 | 4.776 |
| 2.591813939211557 | 2.809 | 2.684 | 4.779 |
| 2.594955531865147 | 2.813 | 2.687 | 4.781 |
| 2.598097124518736 | 2.817 | 2.69 | 4.783 |
| 2.601238717172326 | 2.821 | 2.693 | 4.785 |
| 2.604380309825915 | 2.825 | 2.696 | 4.788 |
| 2.607521902479505 | 2.829 | 2.698 | 4.79 |
| 2.610663495133095 | 2.833 | 2.701 | 4.792 |
| 2.613805087786684 | 2.837 | 2.704 | 4.794 |
| 2.616946680440274 | 2.841 | 2.707 | 4.796 |
| 2.620088273093863 | 2.845 | 2.71 | 4.799 |
| 2.623229865747452 | 2.849 | 2.713 | 4.801 |
| 2.626371458401042 | 2.852 | 2.716 | 4.803 |
| 2.629513051054632 | 2.856 | 2.718 | 4.805 |
| 2.632654643708222 | 2.86 | 2.721 | 4.808 |
| 2.635796236361811 | 2.864 | 2.724 | 4.81 |
| 2.638937829015401 | 2.868 | 2.727 | 4.812 |
| 2.642079421668991 | 2.872 | 2.73 | 4.815 |
| 2.64522101432258 | 2.876 | 2.733 | 4.817 |
| 2.64836260697617 | 2.88 | 2.736 | 4.819 |
| 2.651504199629759 | 2.884 | 2.738 | 4.821 |
| 2.654645792283349 | 2.887 | 2.741 | 4.824 |
| 2.657787384936938 | 2.891 | 2.744 | 4.826 |
| 2.660928977590528 | 2.895 | 2.747 | 4.828 |
| 2.664070570244118 | 2.899 | 2.75 | 4.831 |
| 2.667212162897707 | 2.903 | 2.753 | 4.833 |
| 2.670353755551297 | 2.907 | 2.756 | 4.835 |
| 2.673495348204887 | 2.911 | 2.759 | 4.837 |
| 2.676636940858476 | 2.914 | 2.761 | 4.84 |
| 2.679778533512066 | 2.918 | 2.764 | 4.842 |
| 2.682920126165655 | 2.922 | 2.767 | 4.844 |
| 2.686061718819245 | 2.926 | 2.77 | 4.847 |
| 2.689203311472835 | 2.93 | 2.773 | 4.849 |
| 2.692344904126424 | 2.933 | 2.776 | 4.851 |
| 2.695486496780014 | 2.937 | 2.779 | 4.854 |
| 2.698628089433603 | 2.941 | 2.782 | 4.856 |
| 2.701769682087193 | 2.945 | 2.785 | 4.858 |
| 2.704911274740782 | 2.949 | 2.787 | 4.861 |
| 2.708052867394372 | 2.952 | 2.79 | 4.863 |
| 2.711194460047962 | 2.956 | 2.793 | 4.865 |
| 2.714336052701551 | 2.96 | 2.796 | 4.868 |
| 2.717477645355141 | 2.964 | 2.799 | 4.87 |
| 2.720619238008731 | 2.967 | 2.802 | 4.873 |
| 2.72376083066232 | 2.971 | 2.805 | 4.875 |
| 2.72690242331591 | 2.975 | 2.808 | 4.877 |
| 2.730044015969499 | 2.979 | 2.811 | 4.88 |
| 2.733185608623089 | 2.982 | 2.814 | 4.882 |
| 2.736327201276678 | 2.986 | 2.816 | 4.884 |
| 2.739468793930268 | 2.99 | 2.819 | 4.887 |
| 2.742610386583858 | 2.994 | 2.822 | 4.889 |
| 2.745751979237447 | 2.997 | 2.825 | 4.892 |
| 2.748893571891036 | 3.001 | 2.828 | 4.894 |
| 2.752035164544627 | 3.005 | 2.831 | 4.896 |
| 2.755176757198216 | 3.008 | 2.834 | 4.899 |
| 2.758318349851806 | 3.012 | 2.837 | 4.901 |
| 2.761459942505395 | 3.016 | 2.84 | 4.904 |
| 2.764601535158985 | 3.02 | 2.843 | 4.906 |
| 2.767743127812574 | 3.023 | 2.846 | 4.908 |
| 2.770884720466164 | 3.027 | 2.849 | 4.911 |
| 2.774026313119754 | 3.031 | 2.852 | 4.913 |
| 2.777167905773343 | 3.034 | 2.854 | 4.916 |
| 2.780309498426932 | 3.038 | 2.857 | 4.918 |
| 2.783451091080522 | 3.042 | 2.86 | 4.921 |
| 2.786592683734112 | 3.045 | 2.863 | 4.923 |
| 2.789734276387701 | 3.049 | 2.866 | 4.926 |
| 2.792875869041291 | 3.053 | 2.869 | 4.928 |
| 2.796017461694881 | 3.056 | 2.872 | 4.931 |
| 2.79915905434847 | 3.06 | 2.875 | 4.933 |
| 2.80230064700206 | 3.063 | 2.878 | 4.936 |
| 2.80544223965565 | 3.067 | 2.881 | 4.938 |
| 2.808583832309239 | 3.071 | 2.884 | 4.94 |
| 2.811725424962829 | 3.074 | 2.887 | 4.943 |
| 2.814867017616419 | 3.078 | 2.89 | 4.945 |
| 2.818008610270008 | 3.081 | 2.893 | 4.948 |
| 2.821150202923598 | 3.085 | 2.896 | 4.95 |
| 2.824291795577187 | 3.089 | 2.899 | 4.953 |
| 2.827433388230777 | 3.092 | 2.902 | 4.956 |
| 2.830574980884366 | 3.096 | 2.905 | 4.958 |
| 2.833716573537956 | 3.099 | 2.908 | 4.961 |
| 2.836858166191546 | 3.103 | 2.911 | 4.963 |
| 2.839999758845135 | 3.107 | 2.913 | 4.966 |
| 2.843141351498725 | 3.11 | 2.916 | 4.968 |
| 2.846282944152314 | 3.114 | 2.919 | 4.971 |
| 2.849424536805904 | 3.117 | 2.922 | 4.973 |
| 2.852566129459494 | 3.121 | 2.925 | 4.976 |
| 2.855707722113083 | 3.124 | 2.928 | 4.978 |
| 2.858849314766673 | 3.128 | 2.931 | 4.981 |
| 2.861990907420262 | 3.131 | 2.934 | 4.984 |
| 2.865132500073852 | 3.135 | 2.937 | 4.986 |
| 2.868274092727442 | 3.138 | 2.94 | 4.989 |
| 2.871415685381031 | 3.142 | 2.943 | 4.991 |
| 2.874557278034621 | 3.145 | 2.946 | 4.994 |
| 2.87769887068821 | 3.149 | 2.949 | 4.996 |
| 2.8808404633418 | 3.152 | 2.952 | 4.999 |
| 2.88398205599539 | 3.156 | 2.955 | 5.002 |
| 2.88712364864898 | 3.159 | 2.958 | 5.004 |
| 2.890265241302569 | 3.163 | 2.961 | 5.007 |
| 2.893406833956158 | 3.166 | 2.964 | 5.01 |
| 2.896548426609748 | 3.17 | 2.967 | 5.012 |
| 2.899690019263338 | 3.173 | 2.97 | 5.015 |
| 2.902831611916927 | 3.177 | 2.973 | 5.017 |
| 2.905973204570517 | 3.18 | 2.976 | 5.02 |
| 2.909114797224106 | 3.184 | 2.979 | 5.023 |
| 2.912256389877696 | 3.187 | 2.982 | 5.025 |
| 2.915397982531286 | 3.191 | 2.985 | 5.028 |
| 2.918539575184875 | 3.194 | 2.988 | 5.031 |
| 2.921681167838465 | 3.198 | 2.991 | 5.033 |
| 2.924822760492054 | 3.201 | 2.994 | 5.036 |
| 2.927964353145644 | 3.204 | 2.997 | 5.039 |
| 2.931105945799234 | 3.208 | 3 | 5.041 |
| 2.934247538452823 | 3.211 | 3.003 | 5.044 |
| 2.937389131106413 | 3.215 | 3.006 | 5.047 |
| 2.940530723760002 | 3.218 | 3.009 | 5.05 |
| 2.943672316413592 | 3.222 | 3.012 | 5.052 |
| 2.946813909067182 | 3.225 | 3.015 | 5.055 |
| 2.949955501720771 | 3.228 | 3.018 | 5.058 |
| 2.953097094374361 | 3.232 | 3.021 | 5.06 |
| 2.95623868702795 | 3.235 | 3.024 | 5.063 |
| 2.95938027968154 | 3.239 | 3.027 | 5.066 |
| 2.96252187233513 | 3.242 | 3.03 | 5.069 |
| 2.965663464988719 | 3.245 | 3.033 | 5.071 |
| 2.968805057642309 | 3.249 | 3.036 | 5.074 |
| 2.971946650295898 | 3.252 | 3.04 | 5.077 |
| 2.975088242949488 | 3.255 | 3.043 | 5.08 |
| 2.978229835603078 | 3.259 | 3.046 | 5.082 |
| 2.981371428256667 | 3.262 | 3.049 | 5.085 |
| 2.984513020910257 | 3.266 | 3.052 | 5.088 |
| 2.987654613563846 | 3.269 | 3.055 | 5.091 |
| 2.990796206217436 | 3.272 | 3.058 | 5.094 |
| 2.993937798871025 | 3.276 | 3.061 | 5.096 |
| 2.997079391524615 | 3.279 | 3.064 | 5.099 |
| 3.000220984178205 | 3.282 | 3.067 | 5.102 |
| 3.003362576831794 | 3.286 | 3.07 | 5.105 |
| 3.006504169485384 | 3.289 | 3.073 | 5.108 |
| 3.009645762138974 | 3.292 | 3.076 | 5.111 |
| 3.012787354792563 | 3.296 | 3.079 | 5.113 |
| 3.015928947446153 | 3.299 | 3.082 | 5.116 |
| 3.019070540099742 | 3.302 | 3.085 | 5.119 |
| 3.022212132753332 | 3.305 | 3.088 | 5.122 |
| 3.025353725406922 | 3.309 | 3.091 | 5.125 |
| 3.028495318060511 | 3.312 | 3.095 | 5.128 |
| 3.031636910714101 | 3.315 | 3.098 | 5.131 |
| 3.03477850336769 | 3.319 | 3.101 | 5.133 |
| 3.03792009602128 | 3.322 | 3.104 | 5.136 |
| 3.04106168867487 | 3.325 | 3.107 | 5.139 |
| 3.04420328132846 | 3.328 | 3.11 | 5.142 |
| 3.047344873982049 | 3.332 | 3.113 | 5.145 |
| 3.050486466635638 | 3.335 | 3.116 | 5.148 |
| 3.053628059289228 | 3.338 | 3.119 | 5.151 |
| 3.056769651942818 | 3.341 | 3.122 | 5.154 |
| 3.059911244596407 | 3.345 | 3.125 | 5.157 |
| 3.063052837249997 | 3.348 | 3.128 | 5.16 |
| 3.066194429903586 | 3.351 | 3.132 | 5.163 |
| 3.069336022557176 | 3.354 | 3.135 | 5.166 |
| 3.072477615210766 | 3.358 | 3.138 | 5.169 |
| 3.075619207864355 | 3.361 | 3.141 | 5.172 |
| 3.078760800517945 | 3.364 | 3.144 | 5.175 |
| 3.081902393171534 | 3.367 | 3.147 | 5.178 |
| 3.085043985825124 | 3.371 | 3.15 | 5.181 |
| 3.088185578478713 | 3.374 | 3.153 | 5.184 |
| 3.091327171132303 | 3.377 | 3.156 | 5.187 |
| 3.094468763785893 | 3.38 | 3.159 | 5.19 |
| 3.097610356439482 | 3.383 | 3.163 | 5.193 |
| 3.100751949093072 | 3.387 | 3.166 | 5.196 |
| 3.103893541746661 | 3.39 | 3.169 | 5.199 |
| 3.107035134400251 | 3.393 | 3.172 | 5.202 |
| 3.110176727053841 | 3.396 | 3.175 | 5.205 |
| 3.11331831970743 | 3.399 | 3.178 | 5.208 |
| 3.11645991236102 | 3.402 | 3.181 | 5.211 |
| 3.11960150501461 | 3.406 | 3.184 | 5.214 |
| 3.122743097668199 | 3.409 | 3.188 | 5.217 |
| 3.125884690321789 | 3.412 | 3.191 | 5.22 |
| 3.129026282975378 | 3.415 | 3.194 | 5.223 |
| 3.132167875628968 | 3.418 | 3.197 | 5.227 |
| 3.135309468282557 | 3.421 | 3.2 | 5.23 |
| 3.138451060936147 | 3.425 | 3.203 | 5.233 |
| 3.141592653589737 | 3.428 | 3.206 | 5.236 |
| 3.144734246243326 | 3.431 | 3.21 | 5.239 |
| 3.147875838896916 | 3.434 | 3.213 | 5.242 |
| 3.151017431550505 | 3.437 | 3.216 | 5.245 |
| 3.154159024204095 | 3.44 | 3.219 | 5.249 |
| 3.157300616857685 | 3.443 | 3.222 | 5.252 |
| 3.160442209511274 | 3.447 | 3.225 | 5.255 |
| 3.163583802164864 | 3.45 | 3.228 | 5.258 |
| 3.166725394818453 | 3.453 | 3.232 | 5.261 |
| 3.169866987472043 | 3.456 | 3.235 | 5.265 |
| 3.173008580125633 | 3.459 | 3.238 | 5.268 |
| 3.176150172779222 | 3.462 | 3.241 | 5.271 |
| 3.179291765432812 | 3.465 | 3.244 | 5.274 |
| 3.182433358086401 | 3.468 | 3.247 | 5.278 |
| 3.185574950739991 | 3.471 | 3.251 | 5.281 |
| 3.188716543393581 | 3.474 | 3.254 | 5.284 |
| 3.19185813604717 | 3.478 | 3.257 | 5.287 |
| 3.19499972870076 | 3.481 | 3.26 | 5.291 |
| 3.198141321354349 | 3.484 | 3.263 | 5.294 |
| 3.20128291400794 | 3.487 | 3.266 | 5.297 |
| 3.204424506661528 | 3.49 | 3.27 | 5.3 |
| 3.207566099315118 | 3.493 | 3.273 | 5.304 |
| 3.210707691968708 | 3.496 | 3.276 | 5.307 |
| 3.213849284622297 | 3.499 | 3.279 | 5.31 |
| 3.216990877275887 | 3.502 | 3.282 | 5.314 |
| 3.220132469929476 | 3.505 | 3.286 | 5.317 |
| 3.223274062583066 | 3.508 | 3.289 | 5.32 |
| 3.226415655236656 | 3.511 | 3.292 | 5.324 |
| 3.229557247890245 | 3.514 | 3.295 | 5.327 |
| 3.232698840543835 | 3.517 | 3.298 | 5.331 |
| 3.235840433197425 | 3.52 | 3.302 | 5.334 |
| 3.238982025851014 | 3.523 | 3.305 | 5.337 |
| 3.242123618504604 | 3.526 | 3.308 | 5.341 |
| 3.245265211158193 | 3.529 | 3.311 | 5.344 |
| 3.248406803811783 | 3.532 | 3.314 | 5.348 |
| 3.251548396465373 | 3.535 | 3.318 | 5.351 |
| 3.254689989118962 | 3.538 | 3.321 | 5.355 |
| 3.257831581772551 | 3.541 | 3.324 | 5.358 |
| 3.260973174426141 | 3.544 | 3.327 | 5.361 |
| 3.26411476707973 | 3.547 | 3.33 | 5.365 |
| 3.267256359733321 | 3.55 | 3.334 | 5.368 |
| 3.27039795238691 | 3.553 | 3.337 | 5.372 |
| 3.2735395450405 | 3.556 | 3.34 | 5.375 |
| 3.276681137694089 | 3.559 | 3.343 | 5.379 |
| 3.279822730347679 | 3.562 | 3.347 | 5.382 |
| 3.282964323001269 | 3.565 | 3.35 | 5.386 |
| 3.286105915654858 | 3.568 | 3.353 | 5.39 |
| 3.289247508308448 | 3.571 | 3.356 | 5.393 |
| 3.292389100962037 | 3.574 | 3.359 | 5.397 |
| 3.295530693615627 | 3.577 | 3.363 | 5.4 |
| 3.298672286269217 | 3.58 | 3.366 | 5.404 |
| 3.301813878922806 | 3.583 | 3.369 | 5.407 |
| 3.304955471576396 | 3.586 | 3.372 | 5.411 |
| 3.308097064229985 | 3.589 | 3.376 | 5.415 |
| 3.311238656883575 | 3.592 | 3.379 | 5.418 |
| 3.314380249537165 | 3.595 | 3.382 | 5.422 |
| 3.317521842190754 | 3.598 | 3.385 | 5.426 |
| 3.320663434844344 | 3.601 | 3.389 | 5.429 |
| 3.323805027497933 | 3.604 | 3.392 | 5.433 |
| 3.326946620151523 | 3.607 | 3.395 | 5.437 |
| 3.330088212805113 | 3.61 | 3.399 | 5.44 |
| 3.333229805458702 | 3.612 | 3.402 | 5.444 |
| 3.336371398112292 | 3.615 | 3.405 | 5.448 |
| 3.339512990765881 | 3.618 | 3.408 | 5.451 |
| 3.342654583419471 | 3.621 | 3.412 | 5.455 |
| 3.345796176073061 | 3.624 | 3.415 | 5.459 |
| 3.34893776872665 | 3.627 | 3.418 | 5.463 |
| 3.35207936138024 | 3.63 | 3.421 | 5.466 |
| 3.355220954033829 | 3.633 | 3.425 | 5.47 |
| 3.358362546687419 | 3.636 | 3.428 | 5.474 |
| 3.361504139341009 | 3.639 | 3.431 | 5.478 |
| 3.364645731994598 | 3.641 | 3.435 | 5.482 |
| 3.367787324648188 | 3.644 | 3.438 | 5.485 |
| 3.370928917301777 | 3.647 | 3.441 | 5.489 |
| 3.374070509955367 | 3.65 | 3.444 | 5.493 |
| 3.377212102608956 | 3.653 | 3.448 | 5.497 |
| 3.380353695262546 | 3.656 | 3.451 | 5.501 |
| 3.383495287916136 | 3.659 | 3.454 | 5.505 |
| 3.386636880569725 | 3.662 | 3.458 | 5.509 |
| 3.389778473223315 | 3.664 | 3.461 | 5.512 |
| 3.392920065876904 | 3.667 | 3.464 | 5.516 |
| 3.396061658530494 | 3.67 | 3.468 | 5.52 |
| 3.399203251184084 | 3.673 | 3.471 | 5.524 |
| 3.402344843837673 | 3.676 | 3.474 | 5.528 |
| 3.405486436491263 | 3.679 | 3.477 | 5.532 |
| 3.408628029144852 | 3.682 | 3.481 | 5.536 |
| 3.411769621798442 | 3.684 | 3.484 | 5.54 |
| 3.414911214452032 | 3.687 | 3.487 | 5.544 |
| 3.418052807105621 | 3.69 | 3.491 | 5.548 |
| 3.421194399759211 | 3.693 | 3.494 | 5.552 |
| 3.4243359924128 | 3.696 | 3.497 | 5.556 |
| 3.42747758506639 | 3.699 | 3.501 | 5.56 |
| 3.43061917771998 | 3.701 | 3.504 | 5.564 |
| 3.433760770373569 | 3.704 | 3.507 | 5.568 |
| 3.436902363027159 | 3.707 | 3.511 | 5.572 |
| 3.440043955680748 | 3.71 | 3.514 | 5.577 |
| 3.443185548334338 | 3.713 | 3.517 | 5.581 |
| 3.446327140987927 | 3.715 | 3.521 | 5.585 |
| 3.449468733641517 | 3.718 | 3.524 | 5.589 |
| 3.452610326295107 | 3.721 | 3.527 | 5.593 |
| 3.455751918948696 | 3.724 | 3.531 | 5.597 |
| 3.458893511602286 | 3.727 | 3.534 | 5.601 |
| 3.462035104255876 | 3.729 | 3.537 | 5.606 |
| 3.465176696909465 | 3.732 | 3.541 | 5.61 |
| 3.468318289563055 | 3.735 | 3.544 | 5.614 |
| 3.471459882216644 | 3.738 | 3.548 | 5.618 |
| 3.474601474870234 | 3.741 | 3.551 | 5.623 |
| 3.477743067523824 | 3.743 | 3.554 | 5.627 |
| 3.480884660177413 | 3.746 | 3.558 | 5.631 |
| 3.484026252831002 | 3.749 | 3.561 | 5.635 |
| 3.487167845484592 | 3.752 | 3.564 | 5.64 |
| 3.490309438138182 | 3.754 | 3.568 | 5.644 |
| 3.493451030791772 | 3.757 | 3.571 | 5.648 |
| 3.496592623445361 | 3.76 | 3.574 | 5.653 |
| 3.499734216098951 | 3.763 | 3.578 | 5.657 |
| 3.50287580875254 | 3.765 | 3.581 | 5.661 |
| 3.50601740140613 | 3.768 | 3.585 | 5.666 |
| 3.50915899405972 | 3.771 | 3.588 | 5.67 |
| 3.512300586713309 | 3.774 | 3.591 | 5.675 |
| 3.515442179366899 | 3.776 | 3.595 | 5.679 |
| 3.518583772020488 | 3.779 | 3.598 | 5.684 |
| 3.521725364674078 | 3.782 | 3.602 | 5.688 |
| 3.524866957327668 | 3.785 | 3.605 | 5.692 |
| 3.528008549981257 | 3.787 | 3.608 | 5.697 |
| 3.531150142634847 | 3.79 | 3.612 | 5.701 |
| 3.534291735288436 | 3.793 | 3.615 | 5.706 |
| 3.537433327942026 | 3.796 | 3.619 | 5.71 |
| 3.540574920595616 | 3.798 | 3.622 | 5.715 |
| 3.543716513249205 | 3.801 | 3.625 | 5.72 |
| 3.546858105902795 | 3.804 | 3.629 | 5.724 |
| 3.549999698556384 | 3.806 | 3.632 | 5.729 |
| 3.553141291209974 | 3.809 | 3.636 | 5.733 |
| 3.556282883863564 | 3.812 | 3.639 | 5.738 |
| 3.559424476517153 | 3.815 | 3.642 | 5.743 |
| 3.562566069170743 | 3.817 | 3.646 | 5.747 |
| 3.565707661824332 | 3.82 | 3.649 | 5.752 |
| 3.568849254477922 | 3.823 | 3.653 | 5.757 |
| 3.571990847131511 | 3.825 | 3.656 | 5.761 |
| 3.575132439785101 | 3.828 | 3.66 | 5.766 |
| 3.578274032438691 | 3.831 | 3.663 | 5.771 |
| 3.58141562509228 | 3.833 | 3.666 | 5.776 |
| 3.58455721774587 | 3.836 | 3.67 | 5.78 |
| 3.58769881039946 | 3.839 | 3.673 | 5.785 |
| 3.590840403053049 | 3.841 | 3.677 | 5.79 |
| 3.593981995706639 | 3.844 | 3.68 | 5.795 |
| 3.597123588360228 | 3.847 | 3.684 | 5.8 |
| 3.600265181013818 | 3.849 | 3.687 | 5.805 |
| 3.603406773667407 | 3.852 | 3.69 | 5.809 |
| 3.606548366320997 | 3.855 | 3.694 | 5.814 |
| 3.609689958974587 | 3.857 | 3.697 | 5.819 |
| 3.612831551628176 | 3.86 | 3.701 | 5.824 |
| 3.615973144281766 | 3.863 | 3.704 | 5.829 |
| 3.619114736935355 | 3.865 | 3.708 | 5.834 |
| 3.622256329588945 | 3.868 | 3.711 | 5.839 |
| 3.625397922242534 | 3.871 | 3.715 | 5.844 |
| 3.628539514896124 | 3.873 | 3.718 | 5.849 |
| 3.631681107549714 | 3.876 | 3.722 | 5.854 |
| 3.634822700203303 | 3.879 | 3.725 | 5.859 |
| 3.637964292856893 | 3.881 | 3.729 | 5.864 |
| 3.641105885510483 | 3.884 | 3.732 | 5.869 |
| 3.644247478164072 | 3.887 | 3.736 | 5.874 |
| 3.647389070817662 | 3.889 | 3.739 | 5.879 |
| 3.650530663471251 | 3.892 | 3.742 | 5.885 |
| 3.653672256124841 | 3.894 | 3.746 | 5.89 |
| 3.656813848778431 | 3.897 | 3.749 | 5.895 |
| 3.65995544143202 | 3.9 | 3.753 | 5.9 |
| 3.66309703408561 | 3.902 | 3.756 | 5.905 |
| 3.666238626739199 | 3.905 | 3.76 | 5.911 |
| 3.66938021939279 | 3.908 | 3.763 | 5.916 |
| 3.672521812046378 | 3.91 | 3.767 | 5.921 |
| 3.675663404699968 | 3.913 | 3.77 | 5.926 |
| 3.678804997353558 | 3.915 | 3.774 | 5.932 |
| 3.681946590007147 | 3.918 | 3.777 | 5.937 |
| 3.685088182660737 | 3.921 | 3.781 | 5.942 |
| 3.688229775314326 | 3.923 | 3.784 | 5.948 |
| 3.691371367967916 | 3.926 | 3.788 | 5.953 |
| 3.694512960621506 | 3.928 | 3.791 | 5.959 |
| 3.697654553275095 | 3.931 | 3.795 | 5.964 |
| 3.700796145928685 | 3.934 | 3.798 | 5.969 |
| 3.703937738582274 | 3.936 | 3.802 | 5.975 |
| 3.707079331235864 | 3.939 | 3.805 | 5.98 |
| 3.710220923889454 | 3.941 | 3.809 | 5.986 |
| 3.713362516543043 | 3.944 | 3.812 | 5.991 |
| 3.716504109196633 | 3.947 | 3.816 | 5.997 |
| 3.719645701850223 | 3.949 | 3.82 | 6.003 |
| 3.722787294503812 | 3.952 | 3.823 | 6.008 |
| 3.725928887157402 | 3.954 | 3.827 | 6.014 |
| 3.729070479810991 | 3.957 | 3.83 | 6.019 |
| 3.732212072464581 | 3.959 | 3.834 | 6.025 |
| 3.735353665118171 | 3.962 | 3.837 | 6.031 |
| 3.73849525777176 | 3.965 | 3.841 | 6.036 |
| 3.74163685042535 | 3.967 | 3.844 | 6.042 |
| 3.744778443078939 | 3.97 | 3.848 | 6.048 |
| 3.747920035732529 | 3.972 | 3.851 | 6.054 |
| 3.751061628386119 | 3.975 | 3.855 | 6.059 |
| 3.754203221039708 | 3.977 | 3.858 | 6.065 |
| 3.757344813693298 | 3.98 | 3.862 | 6.071 |
| 3.760486406346887 | 3.982 | 3.866 | 6.077 |
| 3.763627999000477 | 3.985 | 3.869 | 6.083 |
| 3.766769591654067 | 3.988 | 3.873 | 6.089 |
| 3.769911184307656 | 3.99 | 3.876 | 6.095 |
| 3.773052776961246 | 3.993 | 3.88 | 6.101 |
| 3.776194369614835 | 3.995 | 3.883 | 6.106 |
| 3.779335962268425 | 3.998 | 3.887 | 6.112 |
| 3.782477554922014 | 4 | 3.891 | 6.118 |
| 3.785619147575604 | 4.003 | 3.894 | 6.125 |
| 3.788760740229193 | 4.005 | 3.898 | 6.131 |
| 3.791902332882783 | 4.008 | 3.901 | 6.137 |
| 3.795043925536373 | 4.01 | 3.905 | 6.143 |
| 3.798185518189962 | 4.013 | 3.908 | 6.149 |
| 3.801327110843552 | 4.015 | 3.912 | 6.155 |
| 3.804468703497142 | 4.018 | 3.916 | 6.161 |
| 3.807610296150731 | 4.02 | 3.919 | 6.167 |
| 3.810751888804321 | 4.023 | 3.923 | 6.174 |
| 3.813893481457911 | 4.025 | 3.926 | 6.18 |
| 3.8170350741115 | 4.028 | 3.93 | 6.186 |
| 3.82017666676509 | 4.031 | 3.933 | 6.192 |
| 3.823318259418679 | 4.033 | 3.937 | 6.199 |
| 3.826459852072269 | 4.036 | 3.941 | 6.205 |
| 3.829601444725859 | 4.038 | 3.944 | 6.211 |
| 3.832743037379448 | 4.041 | 3.948 | 6.218 |
| 3.835884630033038 | 4.043 | 3.951 | 6.224 |
| 3.839026222686627 | 4.046 | 3.955 | 6.231 |
| 3.842167815340217 | 4.048 | 3.959 | 6.237 |
| 3.845309407993807 | 4.051 | 3.962 | 6.244 |
| 3.848451000647396 | 4.053 | 3.966 | 6.25 |
| 3.851592593300986 | 4.056 | 3.969 | 6.257 |
| 3.854734185954575 | 4.058 | 3.973 | 6.263 |
| 3.857875778608165 | 4.06 | 3.977 | 6.27 |
| 3.861017371261755 | 4.063 | 3.98 | 6.277 |
| 3.864158963915344 | 4.065 | 3.984 | 6.283 |
| 3.867300556568933 | 4.068 | 3.988 | 6.29 |
| 3.870442149222523 | 4.07 | 3.991 | 6.297 |
| 3.873583741876112 | 4.073 | 3.995 | 6.303 |
| 3.876725334529703 | 4.075 | 3.998 | 6.31 |
| 3.879866927183292 | 4.078 | 4.002 | 6.317 |
| 3.883008519836882 | 4.08 | 4.006 | 6.324 |
| 3.886150112490471 | 4.083 | 4.009 | 6.331 |
| 3.889291705144061 | 4.085 | 4.013 | 6.338 |
| 3.892433297797651 | 4.088 | 4.017 | 6.344 |
| 3.89557489045124 | 4.09 | 4.02 | 6.351 |
| 3.89871648310483 | 4.093 | 4.024 | 6.358 |
| 3.901858075758419 | 4.095 | 4.028 | 6.365 |
| 3.904999668412009 | 4.098 | 4.031 | 6.372 |
| 3.908141261065598 | 4.1 | 4.035 | 6.379 |
| 3.911282853719188 | 4.103 | 4.038 | 6.386 |
| 3.914424446372778 | 4.105 | 4.042 | 6.394 |
| 3.917566039026367 | 4.107 | 4.046 | 6.401 |
| 3.920707631679957 | 4.11 | 4.049 | 6.408 |
| 3.923849224333547 | 4.112 | 4.053 | 6.415 |
| 3.926990816987136 | 4.115 | 4.057 | 6.422 |
| 3.930132409640726 | 4.117 | 4.06 | 6.429 |
| 3.933274002294315 | 4.12 | 4.064 | 6.437 |
| 3.936415594947905 | 4.122 | 4.068 | 6.444 |
| 3.939557187601495 | 4.125 | 4.071 | 6.451 |
| 3.942698780255084 | 4.127 | 4.075 | 6.459 |
| 3.945840372908674 | 4.129 | 4.079 | 6.466 |
| 3.948981965562263 | 4.132 | 4.082 | 6.474 |
| 3.952123558215853 | 4.134 | 4.086 | 6.481 |
| 3.955265150869442 | 4.137 | 4.09 | 6.489 |
| 3.958406743523032 | 4.139 | 4.093 | 6.496 |
| 3.961548336176622 | 4.142 | 4.097 | 6.504 |
| 3.964689928830211 | 4.144 | 4.101 | 6.511 |
| 3.967831521483801 | 4.146 | 4.104 | 6.519 |
| 3.97097311413739 | 4.149 | 4.108 | 6.526 |
| 3.97411470679098 | 4.151 | 4.112 | 6.534 |
| 3.97725629944457 | 4.154 | 4.116 | 6.542 |
| 3.98039789209816 | 4.156 | 4.119 | 6.55 |
| 3.983539484751749 | 4.159 | 4.123 | 6.557 |
| 3.986681077405338 | 4.161 | 4.127 | 6.565 |
| 3.989822670058928 | 4.163 | 4.13 | 6.573 |
| 3.992964262712517 | 4.166 | 4.134 | 6.581 |
| 3.996105855366107 | 4.168 | 4.138 | 6.589 |
| 3.999247448019697 | 4.171 | 4.141 | 6.597 |
| 4.002389040673287 | 4.173 | 4.145 | 6.605 |
| 4.005530633326877 | 4.176 | 4.149 | 6.613 |
| 4.008672225980466 | 4.178 | 4.153 | 6.621 |
| 4.011813818634056 | 4.18 | 4.156 | 6.629 |
| 4.014955411287645 | 4.183 | 4.16 | 6.637 |
| 4.018097003941234 | 4.185 | 4.164 | 6.645 |
| 4.021238596594824 | 4.188 | 4.167 | 6.653 |
| 4.024380189248414 | 4.19 | 4.171 | 6.661 |
| 4.027521781902004 | 4.192 | 4.175 | 6.67 |
| 4.030663374555593 | 4.195 | 4.179 | 6.678 |
| 4.033804967209183 | 4.197 | 4.182 | 6.686 |
| 4.036946559862773 | 4.2 | 4.186 | 6.695 |
| 4.040088152516362 | 4.202 | 4.19 | 6.703 |
| 4.043229745169951 | 4.204 | 4.193 | 6.711 |
| 4.046371337823541 | 4.207 | 4.197 | 6.72 |
| 4.049512930477131 | 4.209 | 4.201 | 6.728 |
| 4.05265452313072 | 4.211 | 4.205 | 6.737 |
| 4.05579611578431 | 4.214 | 4.208 | 6.745 |
| 4.0589377084379 | 4.216 | 4.212 | 6.754 |
| 4.062079301091489 | 4.219 | 4.216 | 6.763 |
| 4.065220893745079 | 4.221 | 4.22 | 6.771 |
| 4.068362486398668 | 4.223 | 4.223 | 6.78 |
| 4.071504079052258 | 4.226 | 4.227 | 6.789 |
| 4.074645671705848 | 4.228 | 4.231 | 6.798 |
| 4.077787264359437 | 4.231 | 4.234 | 6.806 |
| 4.080928857013027 | 4.233 | 4.238 | 6.815 |
| 4.084070449666616 | 4.235 | 4.242 | 6.824 |
| 4.087212042320206 | 4.238 | 4.246 | 6.833 |
| 4.090353634973795 | 4.24 | 4.249 | 6.842 |
| 4.093495227627385 | 4.242 | 4.253 | 6.851 |
| 4.096636820280975 | 4.245 | 4.257 | 6.86 |
| 4.099778412934564 | 4.247 | 4.261 | 6.869 |
| 4.102920005588154 | 4.249 | 4.265 | 6.878 |
| 4.106061598241744 | 4.252 | 4.268 | 6.887 |
| 4.109203190895333 | 4.254 | 4.272 | 6.897 |
| 4.112344783548923 | 4.257 | 4.276 | 6.906 |
| 4.115486376202512 | 4.259 | 4.28 | 6.915 |
| 4.118627968856102 | 4.261 | 4.283 | 6.924 |
| 4.121769561509692 | 4.264 | 4.287 | 6.934 |
| 4.124911154163281 | 4.266 | 4.291 | 6.943 |
| 4.128052746816871 | 4.268 | 4.295 | 6.952 |
| 4.13119433947046 | 4.271 | 4.298 | 6.962 |
| 4.13433593212405 | 4.273 | 4.302 | 6.971 |
| 4.13747752477764 | 4.275 | 4.306 | 6.981 |
| 4.14061911743123 | 4.278 | 4.31 | 6.991 |
| 4.143760710084818 | 4.28 | 4.313 | 7 |
| 4.146902302738408 | 4.282 | 4.317 | 7.01 |
| 4.150043895391998 | 4.285 | 4.321 | 7.02 |
| 4.153185488045588 | 4.287 | 4.325 | 7.029 |
| 4.156327080699177 | 4.29 | 4.329 | 7.039 |
| 4.159468673352766 | 4.292 | 4.332 | 7.049 |
| 4.162610266006356 | 4.294 | 4.336 | 7.059 |
| 4.165751858659946 | 4.297 | 4.34 | 7.069 |
| 4.168893451313535 | 4.299 | 4.344 | 7.079 |
| 4.172035043967125 | 4.301 | 4.348 | 7.089 |
| 4.175176636620715 | 4.304 | 4.351 | 7.099 |
| 4.178318229274304 | 4.306 | 4.355 | 7.109 |
| 4.181459821927894 | 4.308 | 4.359 | 7.119 |
| 4.184601414581484 | 4.311 | 4.363 | 7.129 |
| 4.187743007235073 | 4.313 | 4.367 | 7.139 |
| 4.190884599888663 | 4.315 | 4.37 | 7.149 |
| 4.194026192542252 | 4.318 | 4.374 | 7.16 |
| 4.197167785195842 | 4.32 | 4.378 | 7.17 |
| 4.200309377849432 | 4.322 | 4.382 | 7.18 |
| 4.203450970503021 | 4.325 | 4.386 | 7.191 |
| 4.206592563156611 | 4.327 | 4.389 | 7.201 |
| 4.2097341558102 | 4.329 | 4.393 | 7.212 |
| 4.21287574846379 | 4.332 | 4.397 | 7.222 |
| 4.21601734111738 | 4.334 | 4.401 | 7.233 |
| 4.21915893377097 | 4.336 | 4.405 | 7.243 |
| 4.222300526424559 | 4.339 | 4.408 | 7.254 |
| 4.225442119078148 | 4.341 | 4.412 | 7.265 |
| 4.228583711731738 | 4.343 | 4.416 | 7.275 |
| 4.231725304385327 | 4.345 | 4.42 | 7.286 |
| 4.234866897038917 | 4.348 | 4.424 | 7.297 |
| 4.238008489692506 | 4.35 | 4.428 | 7.308 |
| 4.241150082346096 | 4.352 | 4.431 | 7.319 |
| 4.244291674999685 | 4.355 | 4.435 | 7.33 |
| 4.247433267653276 | 4.357 | 4.439 | 7.341 |
| 4.250574860306865 | 4.359 | 4.443 | 7.352 |
| 4.253716452960455 | 4.362 | 4.447 | 7.363 |
| 4.256858045614044 | 4.364 | 4.45 | 7.374 |
| 4.259999638267634 | 4.366 | 4.454 | 7.385 |
| 4.263141230921224 | 4.369 | 4.458 | 7.397 |
| 4.266282823574813 | 4.371 | 4.462 | 7.408 |
| 4.269424416228403 | 4.373 | 4.466 | 7.419 |
| 4.272566008881992 | 4.376 | 4.47 | 7.43 |
| 4.275707601535582 | 4.378 | 4.473 | 7.442 |
| 4.27884919418917 | 4.38 | 4.477 | 7.453 |
| 4.28199078684276 | 4.382 | 4.481 | 7.465 |
| 4.285132379496351 | 4.385 | 4.485 | 7.476 |
| 4.28827397214994 | 4.387 | 4.489 | 7.488 |
| 4.29141556480353 | 4.389 | 4.493 | 7.5 |
| 4.294557157457119 | 4.392 | 4.497 | 7.511 |
| 4.29769875011071 | 4.394 | 4.5 | 7.523 |
| 4.300840342764299 | 4.396 | 4.504 | 7.535 |
| 4.303981935417888 | 4.399 | 4.508 | 7.546 |
| 4.307123528071478 | 4.401 | 4.512 | 7.558 |
| 4.310265120725067 | 4.403 | 4.516 | 7.57 |
| 4.313406713378657 | 4.405 | 4.52 | 7.582 |
| 4.316548306032247 | 4.408 | 4.523 | 7.594 |
| 4.319689898685836 | 4.41 | 4.527 | 7.606 |
| 4.322831491339426 | 4.412 | 4.531 | 7.618 |
| 4.325973083993015 | 4.415 | 4.535 | 7.63 |
| 4.329114676646605 | 4.417 | 4.539 | 7.642 |
| 4.332256269300195 | 4.419 | 4.543 | 7.655 |
| 4.335397861953784 | 4.422 | 4.547 | 7.667 |
| 4.338539454607374 | 4.424 | 4.55 | 7.679 |
| 4.341681047260963 | 4.426 | 4.554 | 7.691 |
| 4.344822639914553 | 4.428 | 4.558 | 7.704 |
| 4.347964232568143 | 4.431 | 4.562 | 7.716 |
| 4.351105825221732 | 4.433 | 4.566 | 7.729 |
| 4.354247417875322 | 4.435 | 4.57 | 7.741 |
| 4.357389010528911 | 4.438 | 4.574 | 7.754 |
| 4.360530603182501 | 4.44 | 4.577 | 7.766 |
| 4.36367219583609 | 4.442 | 4.581 | 7.779 |
| 4.36681378848968 | 4.444 | 4.585 | 7.792 |
| 4.36995538114327 | 4.447 | 4.589 | 7.804 |
| 4.373096973796859 | 4.449 | 4.593 | 7.817 |
| 4.376238566450449 | 4.451 | 4.597 | 7.83 |
| 4.379380159104038 | 4.454 | 4.601 | 7.843 |
| 4.382521751757628 | 4.456 | 4.605 | 7.856 |
| 4.385663344411217 | 4.458 | 4.608 | 7.869 |
| 4.388804937064807 | 4.46 | 4.612 | 7.882 |
| 4.391946529718397 | 4.463 | 4.616 | 7.895 |
| 4.395088122371987 | 4.465 | 4.62 | 7.908 |
| 4.398229715025576 | 4.467 | 4.624 | 7.921 |
| 4.401371307679165 | 4.469 | 4.628 | 7.934 |
| 4.404512900332755 | 4.472 | 4.632 | 7.947 |
| 4.407654492986345 | 4.474 | 4.636 | 7.96 |
| 4.410796085639934 | 4.476 | 4.639 | 7.974 |
| 4.413937678293524 | 4.479 | 4.643 | 7.987 |
| 4.417079270947114 | 4.481 | 4.647 | 8 |
| 4.420220863600703 | 4.483 | 4.651 | 8.014 |
| 4.423362456254293 | 4.485 | 4.655 | 8.027 |
| 4.426504048907883 | 4.488 | 4.659 | 8.041 |
| 4.429645641561472 | 4.49 | 4.663 | 8.054 |
| 4.432787234215062 | 4.492 | 4.667 | 8.068 |
| 4.435928826868651 | 4.494 | 4.671 | 8.082 |
| 4.43907041952224 | 4.497 | 4.674 | 8.095 |
| 4.44221201217583 | 4.499 | 4.678 | 8.109 |
| 4.44535360482942 | 4.501 | 4.682 | 8.123 |
| 4.44849519748301 | 4.504 | 4.686 | 8.136 |
| 4.4516367901366 | 4.506 | 4.69 | 8.15 |
| 4.454778382790188 | 4.508 | 4.694 | 8.164 |
| 4.457919975443779 | 4.51 | 4.698 | 8.178 |
| 4.461061568097368 | 4.513 | 4.702 | 8.192 |
| 4.464203160750958 | 4.515 | 4.706 | 8.206 |
| 4.467344753404547 | 4.517 | 4.71 | 8.22 |
| 4.470486346058137 | 4.519 | 4.713 | 8.234 |
| 4.473627938711726 | 4.522 | 4.717 | 8.248 |
| 4.476769531365316 | 4.524 | 4.721 | 8.262 |
| 4.479911124018905 | 4.526 | 4.725 | 8.276 |
| 4.483052716672495 | 4.528 | 4.729 | 8.291 |
| 4.486194309326085 | 4.531 | 4.733 | 8.305 |
| 4.489335901979674 | 4.533 | 4.737 | 8.319 |
| 4.492477494633264 | 4.535 | 4.741 | 8.333 |
| 4.495619087286854 | 4.537 | 4.745 | 8.348 |
| 4.498760679940443 | 4.54 | 4.749 | 8.362 |
| 4.501902272594033 | 4.542 | 4.752 | 8.377 |
| 4.505043865247622 | 4.544 | 4.756 | 8.391 |
| 4.508185457901212 | 4.546 | 4.76 | 8.405 |
| 4.511327050554801 | 4.549 | 4.764 | 8.42 |
| 4.514468643208391 | 4.551 | 4.768 | 8.435 |
| 4.517610235861981 | 4.553 | 4.772 | 8.449 |
| 4.520751828515571 | 4.556 | 4.776 | 8.464 |
| 4.52389342116916 | 4.558 | 4.78 | 8.478 |
| 4.52703501382275 | 4.56 | 4.784 | 8.493 |
| 4.530176606476339 | 4.562 | 4.788 | 8.508 |
| 4.533318199129928 | 4.565 | 4.792 | 8.523 |
| 4.536459791783518 | 4.567 | 4.795 | 8.537 |
| 4.539601384437108 | 4.569 | 4.799 | 8.552 |
| 4.542742977090698 | 4.571 | 4.803 | 8.567 |
| 4.545884569744287 | 4.574 | 4.807 | 8.582 |
| 4.549026162397876 | 4.576 | 4.811 | 8.597 |
| 4.552167755051466 | 4.578 | 4.815 | 8.612 |
| 4.555309347705056 | 4.58 | 4.819 | 8.627 |
| 4.558450940358646 | 4.583 | 4.823 | 8.642 |
| 4.561592533012235 | 4.585 | 4.827 | 8.657 |
| 4.564734125665825 | 4.587 | 4.831 | 8.672 |
| 4.567875718319415 | 4.589 | 4.835 | 8.687 |
| 4.571017310973004 | 4.592 | 4.839 | 8.702 |
| 4.574158903626594 | 4.594 | 4.842 | 8.717 |
| 4.577300496280183 | 4.596 | 4.846 | 8.732 |
| 4.580442088933772 | 4.598 | 4.85 | 8.747 |
| 4.583583681587362 | 4.601 | 4.854 | 8.762 |
| 4.586725274240952 | 4.603 | 4.858 | 8.778 |
| 4.589866866894542 | 4.605 | 4.862 | 8.793 |
| 4.593008459548131 | 4.607 | 4.866 | 8.808 |
| 4.596150052201721 | 4.61 | 4.87 | 8.823 |
| 4.59929164485531 | 4.612 | 4.874 | 8.839 |
| 4.6024332375089 | 4.614 | 4.878 | 8.854 |
| 4.60557483016249 | 4.616 | 4.882 | 8.869 |
| 4.608716422816079 | 4.619 | 4.886 | 8.885 |
| 4.611858015469668 | 4.621 | 4.889 | 8.9 |
| 4.614999608123258 | 4.623 | 4.893 | 8.916 |
| 4.618141200776848 | 4.625 | 4.897 | 8.931 |
| 4.621282793430437 | 4.628 | 4.901 | 8.946 |
| 4.624424386084027 | 4.63 | 4.905 | 8.962 |
| 4.627565978737617 | 4.632 | 4.909 | 8.977 |
| 4.630707571391206 | 4.634 | 4.913 | 8.993 |
| 4.633849164044795 | 4.637 | 4.917 | 9.008 |
| 4.636990756698386 | 4.639 | 4.921 | 9.024 |
| 4.640132349351975 | 4.641 | 4.925 | 9.039 |
| 4.643273942005564 | 4.643 | 4.929 | 9.055 |
| 4.646415534659154 | 4.646 | 4.933 | 9.071 |
| 4.649557127312744 | 4.648 | 4.937 | 9.086 |
| 4.652698719966334 | 4.65 | 4.94 | 9.102 |
| 4.655840312619923 | 4.652 | 4.944 | 9.117 |
| 4.658981905273513 | 4.654 | 4.948 | 9.133 |
| 4.662123497927102 | 4.657 | 4.952 | 9.149 |
| 4.665265090580692 | 4.659 | 4.956 | 9.164 |
| 4.668406683234282 | 4.661 | 4.96 | 9.18 |
| 4.671548275887871 | 4.663 | 4.964 | 9.195 |
| 4.674689868541461 | 4.666 | 4.968 | 9.211 |
| 4.67783146119505 | 4.668 | 4.972 | 9.227 |
| 4.68097305384864 | 4.67 | 4.976 | 9.242 |
| 4.68411464650223 | 4.672 | 4.98 | 9.258 |
| 4.687256239155819 | 4.675 | 4.984 | 9.274 |
| 4.690397831809409 | 4.677 | 4.988 | 9.29 |
| 4.693539424462998 | 4.679 | 4.992 | 9.305 |
| 4.696681017116588 | 4.681 | 4.995 | 9.321 |
| 4.699822609770177 | 4.684 | 4.999 | 9.337 |
| 4.702964202423767 | 4.686 | 5.003 | 9.352 |
| 4.706105795077356 | 4.688 | 5.007 | 9.368 |
| 4.709247387730946 | 4.69 | 5.011 | 9.384 |
| 4.712388980384535 | 4.693 | 5.015 | 9.399 |
| 4.715530573038126 | 4.695 | 5.019 | 9.415 |
| 4.718672165691715 | 4.697 | 5.023 | 9.431 |
| 4.721813758345305 | 4.699 | 5.027 | 9.447 |
| 4.724955350998894 | 4.702 | 5.031 | 9.462 |
| 4.728096943652484 | 4.704 | 5.035 | 9.478 |
| 4.731238536306074 | 4.706 | 5.039 | 9.494 |
| 4.734380128959663 | 4.708 | 5.043 | 9.509 |
| 4.737521721613253 | 4.711 | 5.046 | 9.525 |
| 4.740663314266842 | 4.713 | 5.05 | 9.541 |
| 4.743804906920432 | 4.715 | 5.054 | 9.556 |
| 4.74694649957402 | 4.717 | 5.058 | 9.572 |
| 4.750088092227611 | 4.72 | 5.062 | 9.588 |
| 4.7532296848812 | 4.722 | 5.066 | 9.603 |
| 4.75637127753479 | 4.724 | 5.07 | 9.619 |
| 4.75951287018838 | 4.726 | 5.074 | 9.635 |
| 4.76265446284197 | 4.729 | 5.078 | 9.65 |
| 4.765796055495559 | 4.731 | 5.082 | 9.666 |
| 4.768937648149149 | 4.733 | 5.086 | 9.682 |
| 4.772079240802738 | 4.735 | 5.09 | 9.697 |
| 4.775220833456327 | 4.738 | 5.094 | 9.713 |
| 4.778362426109917 | 4.74 | 5.098 | 9.728 |
| 4.781504018763507 | 4.742 | 5.101 | 9.744 |
| 4.784645611417097 | 4.744 | 5.105 | 9.76 |
| 4.787787204070686 | 4.747 | 5.109 | 9.775 |
| 4.790928796724275 | 4.749 | 5.113 | 9.791 |
| 4.794070389377865 | 4.751 | 5.117 | 9.806 |
| 4.797211982031455 | 4.753 | 5.121 | 9.822 |
| 4.800353574685045 | 4.755 | 5.125 | 9.837 |
| 4.803495167338634 | 4.758 | 5.129 | 9.853 |
| 4.806636759992224 | 4.76 | 5.133 | 9.868 |
| 4.809778352645814 | 4.762 | 5.137 | 9.883 |
| 4.812919945299403 | 4.764 | 5.141 | 9.899 |
| 4.816061537952993 | 4.767 | 5.145 | 9.914 |
| 4.819203130606582 | 4.769 | 5.149 | 9.93 |
| 4.822344723260172 | 4.771 | 5.152 | 9.945 |
| 4.825486315913761 | 4.773 | 5.156 | 9.96 |
| 4.828627908567351 | 4.776 | 5.16 | 9.976 |
| 4.83176950122094 | 4.778 | 5.164 | 9.991 |
| 4.83491109387453 | 4.78 | 5.168 | 10.006 |
| 4.83805268652812 | 4.782 | 5.172 | 10.021 |
| 4.841194279181709 | 4.785 | 5.176 | 10.037 |
| 4.844335871835299 | 4.787 | 5.18 | 10.052 |
| 4.847477464488889 | 4.789 | 5.184 | 10.067 |
| 4.850619057142478 | 4.791 | 5.188 | 10.082 |
| 4.853760649796068 | 4.794 | 5.192 | 10.097 |
| 4.856902242449657 | 4.796 | 5.196 | 10.112 |
| 4.860043835103247 | 4.798 | 5.199 | 10.127 |
| 4.863185427756837 | 4.8 | 5.203 | 10.142 |
| 4.866327020410426 | 4.803 | 5.207 | 10.157 |
| 4.869468613064015 | 4.805 | 5.211 | 10.172 |
| 4.872610205717605 | 4.807 | 5.215 | 10.187 |
| 4.875751798371195 | 4.809 | 5.219 | 10.202 |
| 4.878893391024784 | 4.812 | 5.223 | 10.217 |
| 4.882034983678374 | 4.814 | 5.227 | 10.232 |
| 4.885176576331964 | 4.816 | 5.231 | 10.247 |
| 4.888318168985553 | 4.818 | 5.235 | 10.262 |
| 4.891459761639143 | 4.821 | 5.239 | 10.276 |
| 4.894601354292733 | 4.823 | 5.243 | 10.291 |
| 4.897742946946322 | 4.825 | 5.246 | 10.306 |
| 4.900884539599912 | 4.828 | 5.25 | 10.321 |
| 4.904026132253501 | 4.83 | 5.254 | 10.335 |
| 4.907167724907091 | 4.832 | 5.258 | 10.35 |
| 4.91030931756068 | 4.834 | 5.262 | 10.364 |
| 4.91345091021427 | 4.837 | 5.266 | 10.379 |
| 4.91659250286786 | 4.839 | 5.27 | 10.394 |
| 4.91973409552145 | 4.841 | 5.274 | 10.408 |
| 4.922875688175039 | 4.843 | 5.278 | 10.422 |
| 4.926017280828628 | 4.846 | 5.282 | 10.437 |
| 4.929158873482218 | 4.848 | 5.286 | 10.451 |
| 4.932300466135808 | 4.85 | 5.289 | 10.466 |
| 4.935442058789397 | 4.852 | 5.293 | 10.48 |
| 4.938583651442987 | 4.855 | 5.297 | 10.494 |
| 4.941725244096576 | 4.857 | 5.301 | 10.508 |
| 4.944866836750166 | 4.859 | 5.305 | 10.523 |
| 4.948008429403755 | 4.861 | 5.309 | 10.537 |
| 4.951150022057345 | 4.864 | 5.313 | 10.551 |
| 4.954291614710935 | 4.866 | 5.317 | 10.565 |
| 4.957433207364524 | 4.868 | 5.321 | 10.579 |
| 4.960574800018114 | 4.87 | 5.325 | 10.593 |
| 4.963716392671704 | 4.873 | 5.328 | 10.607 |
| 4.966857985325293 | 4.875 | 5.332 | 10.621 |
| 4.969999577978883 | 4.877 | 5.336 | 10.635 |
| 4.973141170632472 | 4.879 | 5.34 | 10.649 |
| 4.976282763286062 | 4.882 | 5.344 | 10.663 |
| 4.979424355939651 | 4.884 | 5.348 | 10.676 |
| 4.982565948593241 | 4.886 | 5.352 | 10.69 |
| 4.985707541246831 | 4.889 | 5.356 | 10.704 |
| 4.98884913390042 | 4.891 | 5.36 | 10.717 |
| 4.99199072655401 | 4.893 | 5.363 | 10.731 |
| 4.9951323192076 | 4.895 | 5.367 | 10.745 |
| 4.99827391186119 | 4.898 | 5.371 | 10.758 |
| 5.00141550451478 | 4.9 | 5.375 | 10.772 |
| 5.004557097168369 | 4.902 | 5.379 | 10.785 |
| 5.007698689821958 | 4.904 | 5.383 | 10.798 |
| 5.010840282475548 | 4.907 | 5.387 | 10.812 |
| 5.013981875129137 | 4.909 | 5.391 | 10.825 |
| 5.017123467782727 | 4.911 | 5.395 | 10.838 |
| 5.020265060436317 | 4.914 | 5.398 | 10.852 |
| 5.023406653089906 | 4.916 | 5.402 | 10.865 |
| 5.026548245743496 | 4.918 | 5.406 | 10.878 |
| 5.029689838397085 | 4.92 | 5.41 | 10.891 |
| 5.032831431050674 | 4.923 | 5.414 | 10.904 |
| 5.035973023704264 | 4.925 | 5.418 | 10.917 |
| 5.039114616357854 | 4.927 | 5.422 | 10.93 |
| 5.042256209011444 | 4.929 | 5.426 | 10.943 |
| 5.045397801665033 | 4.932 | 5.429 | 10.956 |
| 5.048539394318622 | 4.934 | 5.433 | 10.969 |
| 5.051680986972213 | 4.936 | 5.437 | 10.982 |
| 5.054822579625802 | 4.939 | 5.441 | 10.995 |
| 5.057964172279392 | 4.941 | 5.445 | 11.007 |
| 5.061105764932981 | 4.943 | 5.449 | 11.02 |
| 5.064247357586571 | 4.945 | 5.453 | 11.033 |
| 5.067388950240161 | 4.948 | 5.457 | 11.045 |
| 5.07053054289375 | 4.95 | 5.46 | 11.058 |
| 5.07367213554734 | 4.952 | 5.464 | 11.07 |
| 5.07681372820093 | 4.955 | 5.468 | 11.083 |
| 5.079955320854519 | 4.957 | 5.472 | 11.095 |
| 5.083096913508108 | 4.959 | 5.476 | 11.107 |
| 5.086238506161698 | 4.961 | 5.48 | 11.12 |
| 5.089380098815288 | 4.964 | 5.484 | 11.132 |
| 5.092521691468877 | 4.966 | 5.487 | 11.144 |
| 5.095663284122466 | 4.968 | 5.491 | 11.157 |
| 5.098804876776057 | 4.971 | 5.495 | 11.169 |
| 5.101946469429646 | 4.973 | 5.499 | 11.181 |
| 5.105088062083236 | 4.975 | 5.503 | 11.193 |
| 5.108229654736825 | 4.978 | 5.507 | 11.205 |
| 5.111371247390415 | 4.98 | 5.511 | 11.217 |
| 5.114512840044005 | 4.982 | 5.514 | 11.229 |
| 5.117654432697594 | 4.984 | 5.518 | 11.241 |
| 5.120796025351184 | 4.987 | 5.522 | 11.253 |
| 5.123937618004773 | 4.989 | 5.526 | 11.264 |
| 5.127079210658363 | 4.991 | 5.53 | 11.276 |
| 5.130220803311953 | 4.994 | 5.534 | 11.288 |
| 5.133362395965542 | 4.996 | 5.537 | 11.299 |
| 5.136503988619131 | 4.998 | 5.541 | 11.311 |
| 5.13964558127272 | 5 | 5.545 | 11.323 |
| 5.142787173926311 | 5.003 | 5.549 | 11.334 |
| 5.1459287665799 | 5.005 | 5.553 | 11.346 |
| 5.14907035923349 | 5.007 | 5.557 | 11.357 |
| 5.15221195188708 | 5.01 | 5.561 | 11.368 |
| 5.15535354454067 | 5.012 | 5.564 | 11.38 |
| 5.158495137194259 | 5.014 | 5.568 | 11.391 |
| 5.161636729847848 | 5.017 | 5.572 | 11.402 |
| 5.164778322501438 | 5.019 | 5.576 | 11.414 |
| 5.167919915155028 | 5.021 | 5.58 | 11.425 |
| 5.171061507808617 | 5.024 | 5.584 | 11.436 |
| 5.174203100462206 | 5.026 | 5.587 | 11.447 |
| 5.177344693115796 | 5.028 | 5.591 | 11.458 |
| 5.180486285769386 | 5.031 | 5.595 | 11.469 |
| 5.183627878422976 | 5.033 | 5.599 | 11.48 |
| 5.186769471076565 | 5.035 | 5.603 | 11.491 |
| 5.189911063730155 | 5.037 | 5.606 | 11.502 |
| 5.193052656383744 | 5.04 | 5.61 | 11.513 |
| 5.196194249037334 | 5.042 | 5.614 | 11.523 |
| 5.199335841690924 | 5.044 | 5.618 | 11.534 |
| 5.202477434344513 | 5.047 | 5.622 | 11.545 |
| 5.205619026998103 | 5.049 | 5.626 | 11.556 |
| 5.208760619651692 | 5.051 | 5.629 | 11.566 |
| 5.211902212305282 | 5.054 | 5.633 | 11.577 |
| 5.215043804958871 | 5.056 | 5.637 | 11.587 |
| 5.218185397612461 | 5.058 | 5.641 | 11.598 |
| 5.221326990266051 | 5.061 | 5.645 | 11.608 |
| 5.22446858291964 | 5.063 | 5.648 | 11.619 |
| 5.22761017557323 | 5.065 | 5.652 | 11.629 |
| 5.23075176822682 | 5.068 | 5.656 | 11.639 |
| 5.23389336088041 | 5.07 | 5.66 | 11.65 |
| 5.237034953533999 | 5.072 | 5.664 | 11.66 |
| 5.240176546187588 | 5.075 | 5.667 | 11.67 |
| 5.243318138841178 | 5.077 | 5.671 | 11.68 |
| 5.246459731494767 | 5.079 | 5.675 | 11.69 |
| 5.249601324148357 | 5.082 | 5.679 | 11.7 |
| 5.252742916801947 | 5.084 | 5.683 | 11.71 |
| 5.255884509455536 | 5.086 | 5.686 | 11.72 |
| 5.259026102109125 | 5.089 | 5.69 | 11.73 |
| 5.262167694762715 | 5.091 | 5.694 | 11.74 |
| 5.265309287416305 | 5.093 | 5.698 | 11.75 |
| 5.268450880069895 | 5.096 | 5.702 | 11.76 |
| 5.271592472723484 | 5.098 | 5.705 | 11.77 |
| 5.274734065377074 | 5.1 | 5.709 | 11.779 |
| 5.277875658030664 | 5.103 | 5.713 | 11.789 |
| 5.281017250684253 | 5.105 | 5.717 | 11.799 |
| 5.284158843337843 | 5.107 | 5.72 | 11.808 |
| 5.287300435991432 | 5.11 | 5.724 | 11.818 |
| 5.290442028645022 | 5.112 | 5.728 | 11.828 |
| 5.293583621298612 | 5.115 | 5.732 | 11.837 |
| 5.296725213952201 | 5.117 | 5.736 | 11.846 |
| 5.299866806605791 | 5.119 | 5.739 | 11.856 |
| 5.30300839925938 | 5.122 | 5.743 | 11.865 |
| 5.30614999191297 | 5.124 | 5.747 | 11.875 |
| 5.30929158456656 | 5.126 | 5.751 | 11.884 |
| 5.312433177220149 | 5.129 | 5.754 | 11.893 |
| 5.315574769873739 | 5.131 | 5.758 | 11.902 |
| 5.318716362527328 | 5.133 | 5.762 | 11.912 |
| 5.321857955180918 | 5.136 | 5.766 | 11.921 |
| 5.324999547834508 | 5.138 | 5.769 | 11.93 |
| 5.328141140488097 | 5.141 | 5.773 | 11.939 |
| 5.331282733141686 | 5.143 | 5.777 | 11.948 |
| 5.334424325795276 | 5.145 | 5.781 | 11.957 |
| 5.337565918448866 | 5.148 | 5.784 | 11.966 |
| 5.340707511102456 | 5.15 | 5.788 | 11.975 |
| 5.343849103756045 | 5.152 | 5.792 | 11.984 |
| 5.346990696409634 | 5.155 | 5.796 | 11.993 |
| 5.350132289063224 | 5.157 | 5.799 | 12.001 |
| 5.353273881716814 | 5.159 | 5.803 | 12.01 |
| 5.356415474370403 | 5.162 | 5.807 | 12.019 |
| 5.359557067023993 | 5.164 | 5.811 | 12.028 |
| 5.362698659677583 | 5.167 | 5.814 | 12.036 |
| 5.365840252331172 | 5.169 | 5.818 | 12.045 |
| 5.368981844984762 | 5.171 | 5.822 | 12.054 |
| 5.372123437638351 | 5.174 | 5.826 | 12.062 |
| 5.375265030291941 | 5.176 | 5.829 | 12.071 |
| 5.378406622945531 | 5.179 | 5.833 | 12.079 |
| 5.38154821559912 | 5.181 | 5.837 | 12.088 |
| 5.38468980825271 | 5.183 | 5.84 | 12.096 |
| 5.387831400906299 | 5.186 | 5.844 | 12.104 |
| 5.39097299355989 | 5.188 | 5.848 | 12.113 |
| 5.394114586213479 | 5.191 | 5.852 | 12.121 |
| 5.397256178867068 | 5.193 | 5.855 | 12.129 |
| 5.400397771520657 | 5.195 | 5.859 | 12.138 |
| 5.403539364174247 | 5.198 | 5.863 | 12.146 |
| 5.406680956827837 | 5.2 | 5.866 | 12.154 |
| 5.409822549481426 | 5.203 | 5.87 | 12.162 |
| 5.412964142135016 | 5.205 | 5.874 | 12.17 |
| 5.416105734788605 | 5.207 | 5.878 | 12.178 |
| 5.419247327442195 | 5.21 | 5.881 | 12.186 |
| 5.422388920095785 | 5.212 | 5.885 | 12.194 |
| 5.425530512749375 | 5.215 | 5.889 | 12.202 |
| 5.428672105402964 | 5.217 | 5.892 | 12.21 |
| 5.431813698056554 | 5.219 | 5.896 | 12.218 |
| 5.434955290710143 | 5.222 | 5.9 | 12.226 |
| 5.438096883363733 | 5.224 | 5.904 | 12.234 |
| 5.441238476017322 | 5.227 | 5.907 | 12.242 |
| 5.444380068670912 | 5.229 | 5.911 | 12.249 |
| 5.447521661324502 | 5.232 | 5.915 | 12.257 |
| 5.450663253978091 | 5.234 | 5.918 | 12.265 |
| 5.453804846631681 | 5.236 | 5.922 | 12.272 |
| 5.456946439285271 | 5.239 | 5.926 | 12.28 |
| 5.46008803193886 | 5.241 | 5.929 | 12.288 |
| 5.46322962459245 | 5.244 | 5.933 | 12.295 |
| 5.466371217246039 | 5.246 | 5.937 | 12.303 |
| 5.46951280989963 | 5.249 | 5.94 | 12.31 |
| 5.472654402553218 | 5.251 | 5.944 | 12.318 |
| 5.475795995206808 | 5.253 | 5.948 | 12.325 |
| 5.478937587860398 | 5.256 | 5.951 | 12.333 |
| 5.482079180513987 | 5.258 | 5.955 | 12.34 |
| 5.485220773167577 | 5.261 | 5.959 | 12.348 |
| 5.488362365821166 | 5.263 | 5.962 | 12.355 |
| 5.491503958474756 | 5.266 | 5.966 | 12.362 |
| 5.494645551128346 | 5.268 | 5.97 | 12.369 |
| 5.497787143781935 | 5.27 | 5.973 | 12.377 |
| 5.500928736435525 | 5.273 | 5.977 | 12.384 |
| 5.504070329089115 | 5.275 | 5.981 | 12.391 |
| 5.507211921742704 | 5.278 | 5.984 | 12.398 |
| 5.510353514396294 | 5.28 | 5.988 | 12.405 |
| 5.513495107049883 | 5.283 | 5.992 | 12.413 |
| 5.516636699703473 | 5.285 | 5.995 | 12.42 |
| 5.519778292357062 | 5.288 | 5.999 | 12.427 |
| 5.522919885010652 | 5.29 | 6.003 | 12.434 |
| 5.526061477664242 | 5.293 | 6.006 | 12.441 |
| 5.529203070317831 | 5.295 | 6.01 | 12.448 |
| 5.532344662971421 | 5.298 | 6.014 | 12.455 |
| 5.535486255625011 | 5.3 | 6.017 | 12.461 |
| 5.5386278482786 | 5.302 | 6.021 | 12.468 |
| 5.54176944093219 | 5.305 | 6.024 | 12.475 |
| 5.544911033585779 | 5.307 | 6.028 | 12.482 |
| 5.54805262623937 | 5.31 | 6.032 | 12.489 |
| 5.551194218892959 | 5.312 | 6.035 | 12.496 |
| 5.554335811546548 | 5.315 | 6.039 | 12.502 |
| 5.557477404200137 | 5.317 | 6.043 | 12.509 |
| 5.560618996853727 | 5.32 | 6.046 | 12.516 |
| 5.563760589507317 | 5.322 | 6.05 | 12.522 |
| 5.566902182160906 | 5.325 | 6.053 | 12.529 |
| 5.570043774814496 | 5.327 | 6.057 | 12.536 |
| 5.573185367468086 | 5.33 | 6.061 | 12.542 |
| 5.576326960121675 | 5.332 | 6.064 | 12.549 |
| 5.579468552775264 | 5.335 | 6.068 | 12.555 |
| 5.582610145428854 | 5.337 | 6.071 | 12.562 |
| 5.585751738082444 | 5.34 | 6.075 | 12.568 |
| 5.588893330736034 | 5.342 | 6.079 | 12.575 |
| 5.592034923389623 | 5.345 | 6.082 | 12.581 |
| 5.595176516043213 | 5.347 | 6.086 | 12.587 |
| 5.598318108696803 | 5.35 | 6.089 | 12.594 |
| 5.601459701350392 | 5.352 | 6.093 | 12.6 |
| 5.604601294003982 | 5.355 | 6.097 | 12.606 |
| 5.607742886657571 | 5.357 | 6.1 | 12.613 |
| 5.610884479311161 | 5.36 | 6.104 | 12.619 |
| 5.61402607196475 | 5.362 | 6.107 | 12.625 |
| 5.61716766461834 | 5.365 | 6.111 | 12.632 |
| 5.62030925727193 | 5.367 | 6.115 | 12.638 |
| 5.623450849925519 | 5.37 | 6.118 | 12.644 |
| 5.626592442579109 | 5.372 | 6.122 | 12.65 |
| 5.629734035232698 | 5.375 | 6.125 | 12.656 |
| 5.632875627886288 | 5.377 | 6.129 | 12.662 |
| 5.636017220539878 | 5.38 | 6.132 | 12.668 |
| 5.639158813193467 | 5.383 | 6.136 | 12.674 |
| 5.642300405847057 | 5.385 | 6.14 | 12.68 |
| 5.645441998500646 | 5.388 | 6.143 | 12.686 |
| 5.648583591154236 | 5.39 | 6.147 | 12.692 |
| 5.651725183807825 | 5.393 | 6.15 | 12.698 |
| 5.654866776461415 | 5.395 | 6.154 | 12.704 |
| 5.658008369115005 | 5.398 | 6.157 | 12.71 |
| 5.661149961768594 | 5.4 | 6.161 | 12.716 |
| 5.664291554422184 | 5.403 | 6.165 | 12.722 |
| 5.667433147075774 | 5.405 | 6.168 | 12.728 |
| 5.670574739729363 | 5.408 | 6.172 | 12.734 |
| 5.673716332382953 | 5.411 | 6.175 | 12.74 |
| 5.676857925036542 | 5.413 | 6.179 | 12.745 |
| 5.679999517690132 | 5.416 | 6.182 | 12.751 |
| 5.683141110343721 | 5.418 | 6.186 | 12.757 |
| 5.686282702997311 | 5.421 | 6.189 | 12.763 |
| 5.689424295650901 | 5.423 | 6.193 | 12.768 |
| 5.69256588830449 | 5.426 | 6.196 | 12.774 |
| 5.69570748095808 | 5.428 | 6.2 | 12.78 |
| 5.69884907361167 | 5.431 | 6.204 | 12.785 |
| 5.701990666265259 | 5.434 | 6.207 | 12.791 |
| 5.705132258918849 | 5.436 | 6.211 | 12.796 |
| 5.708273851572438 | 5.439 | 6.214 | 12.802 |
| 5.711415444226028 | 5.441 | 6.218 | 12.808 |
| 5.714557036879618 | 5.444 | 6.221 | 12.813 |
| 5.717698629533207 | 5.447 | 6.225 | 12.819 |
| 5.720840222186797 | 5.449 | 6.228 | 12.824 |
| 5.723981814840386 | 5.452 | 6.232 | 12.83 |
| 5.727123407493976 | 5.454 | 6.235 | 12.835 |
| 5.730265000147565 | 5.457 | 6.239 | 12.84 |
| 5.733406592801155 | 5.459 | 6.242 | 12.846 |
| 5.736548185454744 | 5.462 | 6.246 | 12.851 |
| 5.739689778108334 | 5.465 | 6.249 | 12.857 |
| 5.742831370761924 | 5.467 | 6.253 | 12.862 |
| 5.745972963415514 | 5.47 | 6.256 | 12.867 |
| 5.749114556069103 | 5.472 | 6.26 | 12.873 |
| 5.752256148722693 | 5.475 | 6.263 | 12.878 |
| 5.755397741376282 | 5.478 | 6.267 | 12.883 |
| 5.758539334029872 | 5.48 | 6.27 | 12.888 |
| 5.761680926683462 | 5.483 | 6.274 | 12.894 |
| 5.764822519337051 | 5.486 | 6.277 | 12.899 |
| 5.767964111990641 | 5.488 | 6.281 | 12.904 |
| 5.77110570464423 | 5.491 | 6.284 | 12.909 |
| 5.77424729729782 | 5.493 | 6.288 | 12.914 |
| 5.77738888995141 | 5.496 | 6.291 | 12.92 |
| 5.780530482605 | 5.499 | 6.295 | 12.925 |
| 5.783672075258588 | 5.501 | 6.298 | 12.93 |
| 5.786813667912178 | 5.504 | 6.302 | 12.935 |
| 5.789955260565768 | 5.507 | 6.305 | 12.94 |
| 5.793096853219358 | 5.509 | 6.309 | 12.945 |
| 5.796238445872947 | 5.512 | 6.312 | 12.95 |
| 5.799380038526537 | 5.515 | 6.315 | 12.955 |
| 5.802521631180126 | 5.517 | 6.319 | 12.96 |
| 5.805663223833715 | 5.52 | 6.322 | 12.965 |
| 5.808804816487306 | 5.523 | 6.326 | 12.97 |
| 5.811946409140895 | 5.525 | 6.329 | 12.975 |
| 5.815088001794485 | 5.528 | 6.333 | 12.98 |
| 5.818229594448074 | 5.53 | 6.336 | 12.985 |
| 5.821371187101663 | 5.533 | 6.34 | 12.99 |
| 5.824512779755254 | 5.536 | 6.343 | 12.994 |
| 5.827654372408843 | 5.538 | 6.347 | 12.999 |
| 5.830795965062433 | 5.541 | 6.35 | 13.004 |
| 5.833937557716022 | 5.544 | 6.353 | 13.009 |
| 5.837079150369612 | 5.547 | 6.357 | 13.014 |
| 5.840220743023201 | 5.549 | 6.36 | 13.019 |
| 5.843362335676791 | 5.552 | 6.364 | 13.023 |
| 5.846503928330381 | 5.555 | 6.367 | 13.028 |
| 5.84964552098397 | 5.557 | 6.371 | 13.033 |
| 5.85278711363756 | 5.56 | 6.374 | 13.038 |
| 5.85592870629115 | 5.563 | 6.377 | 13.042 |
| 5.85907029894474 | 5.565 | 6.381 | 13.047 |
| 5.862211891598329 | 5.568 | 6.384 | 13.052 |
| 5.865353484251918 | 5.571 | 6.388 | 13.056 |
| 5.868495076905508 | 5.573 | 6.391 | 13.061 |
| 5.871636669559098 | 5.576 | 6.395 | 13.066 |
| 5.874778262212687 | 5.579 | 6.398 | 13.07 |
| 5.877919854866277 | 5.582 | 6.401 | 13.075 |
| 5.881061447519866 | 5.584 | 6.405 | 13.079 |
| 5.884203040173456 | 5.587 | 6.408 | 13.084 |
| 5.887344632827046 | 5.59 | 6.412 | 13.088 |
| 5.890486225480635 | 5.592 | 6.415 | 13.093 |
| 5.893627818134224 | 5.595 | 6.418 | 13.098 |
| 5.896769410787814 | 5.598 | 6.422 | 13.102 |
| 5.899911003441404 | 5.601 | 6.425 | 13.107 |
| 5.903052596094994 | 5.603 | 6.429 | 13.111 |
| 5.906194188748583 | 5.606 | 6.432 | 13.115 |
| 5.909335781402172 | 5.609 | 6.435 | 13.12 |
| 5.912477374055762 | 5.612 | 6.439 | 13.124 |
| 5.915618966709352 | 5.614 | 6.442 | 13.129 |
| 5.918760559362942 | 5.617 | 6.446 | 13.133 |
| 5.921902152016531 | 5.62 | 6.449 | 13.138 |
| 5.92504374467012 | 5.623 | 6.452 | 13.142 |
| 5.92818533732371 | 5.625 | 6.456 | 13.146 |
| 5.9313269299773 | 5.628 | 6.459 | 13.151 |
| 5.93446852263089 | 5.631 | 6.462 | 13.155 |
| 5.93761011528448 | 5.634 | 6.466 | 13.159 |
| 5.940751707938068 | 5.636 | 6.469 | 13.164 |
| 5.943893300591658 | 5.639 | 6.473 | 13.168 |
| 5.947034893245248 | 5.642 | 6.476 | 13.172 |
| 5.950176485898837 | 5.645 | 6.479 | 13.176 |
| 5.953318078552427 | 5.648 | 6.483 | 13.181 |
| 5.956459671206017 | 5.65 | 6.486 | 13.185 |
| 5.959601263859606 | 5.653 | 6.489 | 13.189 |
| 5.962742856513196 | 5.656 | 6.493 | 13.193 |
| 5.965884449166785 | 5.659 | 6.496 | 13.197 |
| 5.969026041820375 | 5.661 | 6.499 | 13.202 |
| 5.972167634473964 | 5.664 | 6.503 | 13.206 |
| 5.975309227127554 | 5.667 | 6.506 | 13.21 |
| 5.978450819781144 | 5.67 | 6.509 | 13.214 |
| 5.981592412434733 | 5.673 | 6.513 | 13.218 |
| 5.984734005088323 | 5.675 | 6.516 | 13.222 |
| 5.987875597741913 | 5.678 | 6.519 | 13.226 |
| 5.991017190395502 | 5.681 | 6.523 | 13.231 |
| 5.994158783049092 | 5.684 | 6.526 | 13.235 |
| 5.997300375702681 | 5.687 | 6.529 | 13.239 |
| 6.000441968356271 | 5.69 | 6.533 | 13.243 |
| 6.003583561009861 | 5.692 | 6.536 | 13.247 |
| 6.00672515366345 | 5.695 | 6.539 | 13.251 |
| 6.00986674631704 | 5.698 | 6.543 | 13.255 |
| 6.01300833897063 | 5.701 | 6.546 | 13.259 |
| 6.01614993162422 | 5.704 | 6.549 | 13.263 |
| 6.019291524277808 | 5.707 | 6.553 | 13.267 |
| 6.022433116931398 | 5.709 | 6.556 | 13.271 |
| 6.025574709584988 | 5.712 | 6.559 | 13.275 |
| 6.028716302238577 | 5.715 | 6.563 | 13.279 |
| 6.031857894892167 | 5.718 | 6.566 | 13.283 |
| 6.034999487545757 | 5.721 | 6.569 | 13.286 |
| 6.038141080199346 | 5.724 | 6.573 | 13.29 |
| 6.041282672852935 | 5.727 | 6.576 | 13.294 |
| 6.044424265506525 | 5.729 | 6.579 | 13.298 |
| 6.047565858160115 | 5.732 | 6.582 | 13.302 |
| 6.050707450813704 | 5.735 | 6.586 | 13.306 |
| 6.053849043467294 | 5.738 | 6.589 | 13.31 |
| 6.056990636120884 | 5.741 | 6.592 | 13.314 |
| 6.060132228774473 | 5.744 | 6.596 | 13.317 |
| 6.063273821428063 | 5.747 | 6.599 | 13.321 |
| 6.066415414081653 | 5.75 | 6.602 | 13.325 |
| 6.069557006735242 | 5.752 | 6.605 | 13.329 |
| 6.072698599388831 | 5.755 | 6.609 | 13.333 |
| 6.07584019204242 | 5.758 | 6.612 | 13.336 |
| 6.078981784696011 | 5.761 | 6.615 | 13.34 |
| 6.082123377349601 | 5.764 | 6.619 | 13.344 |
| 6.08526497000319 | 5.767 | 6.622 | 13.348 |
| 6.08840656265678 | 5.77 | 6.625 | 13.351 |
| 6.09154815531037 | 5.773 | 6.628 | 13.355 |
| 6.094689747963959 | 5.776 | 6.632 | 13.359 |
| 6.097831340617549 | 5.779 | 6.635 | 13.362 |
| 6.100972933271138 | 5.782 | 6.638 | 13.366 |
| 6.104114525924728 | 5.785 | 6.641 | 13.37 |
| 6.107256118578317 | 5.787 | 6.645 | 13.373 |
| 6.110397711231907 | 5.79 | 6.648 | 13.377 |
| 6.113539303885497 | 5.793 | 6.651 | 13.381 |
| 6.116680896539086 | 5.796 | 6.654 | 13.384 |
| 6.119822489192675 | 5.799 | 6.658 | 13.388 |
| 6.122964081846265 | 5.802 | 6.661 | 13.392 |
| 6.126105674499855 | 5.805 | 6.664 | 13.395 |
| 6.129247267153445 | 5.808 | 6.667 | 13.399 |
| 6.132388859807034 | 5.811 | 6.671 | 13.402 |
| 6.135530452460624 | 5.814 | 6.674 | 13.406 |
| 6.138672045114213 | 5.817 | 6.677 | 13.409 |
| 6.141813637767803 | 5.82 | 6.68 | 13.413 |
| 6.144955230421393 | 5.823 | 6.684 | 13.416 |
| 6.148096823074982 | 5.826 | 6.687 | 13.42 |
| 6.151238415728571 | 5.829 | 6.69 | 13.424 |
| 6.154380008382161 | 5.832 | 6.693 | 13.427 |
| 6.157521601035751 | 5.835 | 6.697 | 13.431 |
| 6.16066319368934 | 5.838 | 6.7 | 13.434 |
| 6.16380478634293 | 5.841 | 6.703 | 13.437 |
| 6.16694637899652 | 5.844 | 6.706 | 13.441 |
| 6.170087971650109 | 5.847 | 6.709 | 13.444 |
| 6.173229564303698 | 5.85 | 6.713 | 13.448 |
| 6.176371156957289 | 5.853 | 6.716 | 13.451 |
| 6.179512749610878 | 5.856 | 6.719 | 13.455 |
| 6.182654342264468 | 5.859 | 6.722 | 13.458 |
| 6.185795934918057 | 5.862 | 6.725 | 13.462 |
| 6.188937527571647 | 5.865 | 6.729 | 13.465 |
| 6.192079120225237 | 5.868 | 6.732 | 13.468 |
| 6.195220712878826 | 5.871 | 6.735 | 13.472 |
| 6.198362305532415 | 5.874 | 6.738 | 13.475 |
| 6.201503898186005 | 5.877 | 6.741 | 13.478 |
| 6.204645490839594 | 5.88 | 6.745 | 13.482 |
| 6.207787083493184 | 5.883 | 6.748 | 13.485 |
| 6.210928676146774 | 5.886 | 6.751 | 13.489 |
| 6.214070268800364 | 5.889 | 6.754 | 13.492 |
| 6.217211861453953 | 5.892 | 6.757 | 13.495 |
| 6.220353454107543 | 5.895 | 6.761 | 13.498 |
| 6.223495046761133 | 5.899 | 6.764 | 13.502 |
| 6.226636639414722 | 5.902 | 6.767 | 13.505 |
| 6.229778232068312 | 5.905 | 6.77 | 13.508 |
| 6.232919824721901 | 5.908 | 6.773 | 13.512 |
| 6.236061417375491 | 5.911 | 6.776 | 13.515 |
| 6.23920301002908 | 5.914 | 6.78 | 13.518 |
| 6.24234460268267 | 5.917 | 6.783 | 13.521 |
| 6.24548619533626 | 5.92 | 6.786 | 13.525 |
| 6.24862778798985 | 5.923 | 6.789 | 13.528 |
| 6.251769380643438 | 5.926 | 6.792 | 13.531 |
| 6.254910973297028 | 5.929 | 6.795 | 13.534 |
| 6.258052565950618 | 5.933 | 6.799 | 13.538 |
| 6.261194158604208 | 5.936 | 6.802 | 13.541 |
| 6.264335751257797 | 5.939 | 6.805 | 13.544 |
| 6.267477343911387 | 5.942 | 6.808 | 13.547 |
| 6.270618936564976 | 5.945 | 6.811 | 13.55 |
| 6.273760529218566 | 5.948 | 6.814 | 13.553 |
| 6.276902121872155 | 5.951 | 6.817 | 13.557 |
| 6.280043714525745 | 5.954 | 6.821 | 13.56 |
| 6.283185307179335 | 5.958 | 6.824 | 13.563 |